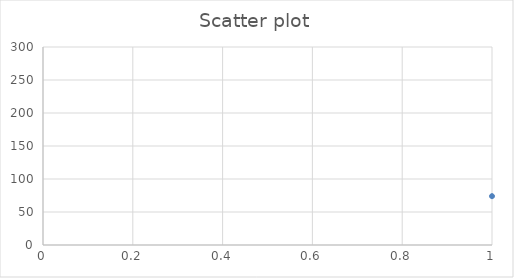
| Category | Series 0 |
|---|---|
| 0 | 74 |
| 1 | 87 |
| 2 | 99 |
| 3 | 61 |
| 4 | 76 |
| 5 | 87 |
| 6 | 92 |
| 7 | 89 |
| 8 | 124 |
| 9 | 77 |
| 10 | 51 |
| 11 | 77 |
| 12 | 71 |
| 13 | 78 |
| 14 | 66 |
| 15 | 78 |
| 16 | 102 |
| 17 | 67 |
| 18 | 42 |
| 19 | 77 |
| 20 | 157 |
| 21 | 115 |
| 22 | 76 |
| 23 | 83 |
| 24 | 78 |
| 25 | 83 |
| 26 | 52 |
| 27 | 57 |
| 28 | 63 |
| 29 | 79 |
| 30 | 101 |
| 31 | 79 |
| 32 | 67 |
| 33 | 72 |
| 34 | 60 |
| 35 | 130 |
| 36 | 46 |
| 37 | 84 |
| 38 | 147 |
| 39 | 102 |
| 40 | 95 |
| 41 | 96 |
| 42 | 64 |
| 43 | 40 |
| 44 | 173 |
| 45 | 88 |
| 46 | 80 |
| 47 | 124 |
| 48 | 89 |
| 49 | 66 |
| 50 | 71 |
| 51 | 81 |
| 52 | 84 |
| 53 | 100 |
| 54 | 140 |
| 55 | 67 |
| 56 | 126 |
| 57 | 70 |
| 58 | 55 |
| 59 | 99 |
| 60 | 76 |
| 61 | 91 |
| 62 | 164 |
| 63 | 152 |
| 64 | 128 |
| 65 | 131 |
| 66 | 122 |
| 67 | 191 |
| 68 | 87 |
| 69 | 83 |
| 70 | 85 |
| 71 | 63 |
| 72 | 93 |
| 73 | 76 |
| 74 | 107 |
| 75 | 64 |
| 76 | 78 |
| 77 | 140 |
| 78 | 66 |
| 79 | 51 |
| 80 | 112 |
| 81 | 52 |
| 82 | 73 |
| 83 | 81 |
| 84 | 109 |
| 85 | 68 |
| 86 | 57 |
| 87 | 78 |
| 88 | 67 |
| 89 | 120 |
| 90 | 87 |
| 91 | 69 |
| 92 | 71 |
| 93 | 108 |
| 94 | 76 |
| 95 | 83 |
| 96 | 113 |
| 97 | 72 |
| 98 | 116 |
| 99 | 89 |
| 100 | 100 |
| 101 | 110 |
| 102 | 76 |
| 103 | 84 |
| 104 | 123 |
| 105 | 77 |
| 106 | 83 |
| 107 | 71 |
| 108 | 82 |
| 109 | 87 |
| 110 | 66 |
| 111 | 61 |
| 112 | 114 |
| 113 | 76 |
| 114 | 72 |
| 115 | 100 |
| 116 | 46 |
| 117 | 53 |
| 118 | 136 |
| 119 | 105 |
| 120 | 65 |
| 121 | 106 |
| 122 | 108 |
| 123 | 61 |
| 124 | 93 |
| 125 | 67 |
| 126 | 110 |
| 127 | 158 |
| 128 | 79 |
| 129 | 75 |
| 130 | 92 |
| 131 | 136 |
| 132 | 74 |
| 133 | 117 |
| 134 | 114 |
| 135 | 102 |
| 136 | 86 |
| 137 | 105 |
| 138 | 91 |
| 139 | 64 |
| 140 | 58 |
| 141 | 104 |
| 142 | 138 |
| 143 | 109 |
| 144 | 71 |
| 145 | 98 |
| 146 | 54 |
| 147 | 78 |
| 148 | 48 |
| 149 | 147 |
| 150 | 160 |
| 151 | 80 |
| 152 | 73 |
| 153 | 72 |
| 154 | 117 |
| 155 | 125 |
| 156 | 107 |
| 157 | 95 |
| 158 | 76 |
| 159 | 38 |
| 160 | 65 |
| 161 | 97 |
| 162 | 74 |
| 163 | 103 |
| 164 | 118 |
| 165 | 106 |
| 166 | 79 |
| 167 | 54 |
| 168 | 75 |
| 169 | 74 |
| 170 | 96 |
| 171 | 86 |
| 172 | 84 |
| 173 | 79 |
| 174 | 98 |
| 175 | 88 |
| 176 | 74 |
| 177 | 139 |
| 178 | 79 |
| 179 | 72 |
| 180 | 97 |
| 181 | 80 |
| 182 | 89 |
| 183 | 145 |
| 184 | 81 |
| 185 | 73 |
| 186 | 100 |
| 187 | 102 |
| 188 | 145 |
| 189 | 92 |
| 190 | 83 |
| 191 | 108 |
| 192 | 101 |
| 193 | 97 |
| 194 | 106 |
| 195 | 171 |
| 196 | 102 |
| 197 | 102 |
| 198 | 140 |
| 199 | 125 |
| 200 | 74 |
| 201 | 75 |
| 202 | 122 |
| 203 | 87 |
| 204 | 61 |
| 205 | 80 |
| 206 | 60 |
| 207 | 202 |
| 208 | 75 |
| 209 | 70 |
| 210 | 107 |
| 211 | 63 |
| 212 | 92 |
| 213 | 87 |
| 214 | 83 |
| 215 | 77 |
| 216 | 73 |
| 217 | 91 |
| 218 | 76 |
| 219 | 74 |
| 220 | 92 |
| 221 | 113 |
| 222 | 83 |
| 223 | 139 |
| 224 | 66 |
| 225 | 49 |
| 226 | 65 |
| 227 | 72 |
| 228 | 88 |
| 229 | 74 |
| 230 | 81 |
| 231 | 87 |
| 232 | 79 |
| 233 | 92 |
| 234 | 84 |
| 235 | 130 |
| 236 | 77 |
| 237 | 66 |
| 238 | 62 |
| 239 | 75 |
| 240 | 95 |
| 241 | 49 |
| 242 | 69 |
| 243 | 122 |
| 244 | 83 |
| 245 | 137 |
| 246 | 83 |
| 247 | 52 |
| 248 | 95 |
| 249 | 64 |
| 250 | 87 |
| 251 | 76 |
| 252 | 65 |
| 253 | 78 |
| 254 | 48 |
| 255 | 88 |
| 256 | 114 |
| 257 | 78 |
| 258 | 85 |
| 259 | 90 |
| 260 | 79 |
| 261 | 110 |
| 262 | 57 |
| 263 | 66 |
| 264 | 75 |
| 265 | 98 |
| 266 | 136 |
| 267 | 83 |
| 268 | 67 |
| 269 | 75 |
| 270 | 124 |
| 271 | 43 |
| 272 | 85 |
| 273 | 97 |
| 274 | 91 |
| 275 | 67 |
| 276 | 114 |
| 277 | 75 |
| 278 | 90 |
| 279 | 91 |
| 280 | 78 |
| 281 | 46 |
| 282 | 77 |
| 283 | 80 |
| 284 | 121 |
| 285 | 119 |
| 286 | 67 |
| 287 | 91 |
| 288 | 133 |
| 289 | 123 |
| 290 | 111 |
| 291 | 79 |
| 292 | 101 |
| 293 | 62 |
| 294 | 109 |
| 295 | 85 |
| 296 | 69 |
| 297 | 127 |
| 298 | 118 |
| 299 | 112 |
| 300 | 106 |
| 301 | 84 |
| 302 | 94 |
| 303 | 79 |
| 304 | 101 |
| 305 | 80 |
| 306 | 89 |
| 307 | 70 |
| 308 | 73 |
| 309 | 88 |
| 310 | 100 |
| 311 | 106 |
| 312 | 83 |
| 313 | 89 |
| 314 | 78 |
| 315 | 92 |
| 316 | 81 |
| 317 | 90 |
| 318 | 76 |
| 319 | 75 |
| 320 | 80 |
| 321 | 82 |
| 322 | 69 |
| 323 | 104 |
| 324 | 69 |
| 325 | 72 |
| 326 | 74 |
| 327 | 49 |
| 328 | 79 |
| 329 | 85 |
| 330 | 112 |
| 331 | 88 |
| 332 | 43 |
| 333 | 120 |
| 334 | 137 |
| 335 | 45 |
| 336 | 123 |
| 337 | 62 |
| 338 | 60 |
| 339 | 97 |
| 340 | 136 |
| 341 | 69 |
| 342 | 91 |
| 343 | 60 |
| 344 | 76 |
| 345 | 141 |
| 346 | 64 |
| 347 | 82 |
| 348 | 126 |
| 349 | 85 |
| 350 | 60 |
| 351 | 67 |
| 352 | 88 |
| 353 | 94 |
| 354 | 160 |
| 355 | 160 |
| 356 | 84 |
| 357 | 86 |
| 358 | 77 |
| 359 | 68 |
| 360 | 74 |
| 361 | 77 |
| 362 | 67 |
| 363 | 98 |
| 364 | 53 |
| 365 | 87 |
| 366 | 61 |
| 367 | 115 |
| 368 | 92 |
| 369 | 70 |
| 370 | 44 |
| 371 | 125 |
| 372 | 78 |
| 373 | 90 |
| 374 | 100 |
| 375 | 128 |
| 376 | 51 |
| 377 | 125 |
| 378 | 48 |
| 379 | 96 |
| 380 | 81 |
| 381 | 78 |
| 382 | 116 |
| 383 | 110 |
| 384 | 84 |
| 385 | 66 |
| 386 | 136 |
| 387 | 90 |
| 388 | 81 |
| 389 | 70 |
| 390 | 74 |
| 391 | 112 |
| 392 | 97 |
| 393 | 46 |
| 394 | 34 |
| 395 | 71 |
| 396 | 106 |
| 397 | 67 |
| 398 | 78 |
| 399 | 78 |
| 400 | 62 |
| 401 | 76 |
| 402 | 71 |
| 403 | 86 |
| 404 | 99 |
| 405 | 99 |
| 406 | 75 |
| 407 | 100 |
| 408 | 116 |
| 409 | 60 |
| 410 | 80 |
| 411 | 201 |
| 412 | 85 |
| 413 | 63 |
| 414 | 109 |
| 415 | 86 |
| 416 | 100 |
| 417 | 80 |
| 418 | 73 |
| 419 | 72 |
| 420 | 82 |
| 421 | 67 |
| 422 | 102 |
| 423 | 104 |
| 424 | 73 |
| 425 | 85 |
| 426 | 114 |
| 427 | 61 |
| 428 | 76 |
| 429 | 101 |
| 430 | 86 |
| 431 | 68 |
| 432 | 88 |
| 433 | 126 |
| 434 | 96 |
| 435 | 119 |
| 436 | 109 |
| 437 | 85 |
| 438 | 57 |
| 439 | 45 |
| 440 | 113 |
| 441 | 36 |
| 442 | 106 |
| 443 | 70 |
| 444 | 57 |
| 445 | 63 |
| 446 | 83 |
| 447 | 61 |
| 448 | 65 |
| 449 | 45 |
| 450 | 57 |
| 451 | 100 |
| 452 | 75 |
| 453 | 87 |
| 454 | 45 |
| 455 | 116 |
| 456 | 63 |
| 457 | 70 |
| 458 | 84 |
| 459 | 79 |
| 460 | 82 |
| 461 | 62 |
| 462 | 82 |
| 463 | 123 |
| 464 | 84 |
| 465 | 149 |
| 466 | 81 |
| 467 | 109 |
| 468 | 80 |
| 469 | 118 |
| 470 | 97 |
| 471 | 91 |
| 472 | 116 |
| 473 | 84 |
| 474 | 58 |
| 475 | 71 |
| 476 | 88 |
| 477 | 104 |
| 478 | 131 |
| 479 | 77 |
| 480 | 96 |
| 481 | 62 |
| 482 | 57 |
| 483 | 61 |
| 484 | 131 |
| 485 | 71 |
| 486 | 83 |
| 487 | 69 |
| 488 | 70 |
| 489 | 88 |
| 490 | 81 |
| 491 | 77 |
| 492 | 97 |
| 493 | 91 |
| 494 | 112 |
| 495 | 71 |
| 496 | 99 |
| 497 | 74 |
| 498 | 85 |
| 499 | 165 |
| 500 | 96 |
| 501 | 104 |
| 502 | 138 |
| 503 | 87 |
| 504 | 115 |
| 505 | 79 |
| 506 | 66 |
| 507 | 56 |
| 508 | 66 |
| 509 | 98 |
| 510 | 81 |
| 511 | 88 |
| 512 | 136 |
| 513 | 141 |
| 514 | 86 |
| 515 | 65 |
| 516 | 124 |
| 517 | 73 |
| 518 | 69 |
| 519 | 77 |
| 520 | 80 |
| 521 | 113 |
| 522 | 117 |
| 523 | 96 |
| 524 | 59 |
| 525 | 83 |
| 526 | 98 |
| 527 | 156 |
| 528 | 52 |
| 529 | 59 |
| 530 | 73 |
| 531 | 72 |
| 532 | 52 |
| 533 | 84 |
| 534 | 82 |
| 535 | 97 |
| 536 | 92 |
| 537 | 94 |
| 538 | 162 |
| 539 | 74 |
| 540 | 78 |
| 541 | 75 |
| 542 | 106 |
| 543 | 77 |
| 544 | 99 |
| 545 | 106 |
| 546 | 43 |
| 547 | 121 |
| 548 | 124 |
| 549 | 107 |
| 550 | 36 |
| 551 | 62 |
| 552 | 50 |
| 553 | 122 |
| 554 | 144 |
| 555 | 78 |
| 556 | 133 |
| 557 | 144 |
| 558 | 56 |
| 559 | 69 |
| 560 | 148 |
| 561 | 205 |
| 562 | 77 |
| 563 | 88 |
| 564 | 66 |
| 565 | 50 |
| 566 | 130 |
| 567 | 63 |
| 568 | 79 |
| 569 | 93 |
| 570 | 167 |
| 571 | 85 |
| 572 | 55 |
| 573 | 96 |
| 574 | 98 |
| 575 | 69 |
| 576 | 97 |
| 577 | 81 |
| 578 | 91 |
| 579 | 147 |
| 580 | 77 |
| 581 | 33 |
| 582 | 68 |
| 583 | 54 |
| 584 | 71 |
| 585 | 69 |
| 586 | 118 |
| 587 | 89 |
| 588 | 75 |
| 589 | 112 |
| 590 | 98 |
| 591 | 59 |
| 592 | 89 |
| 593 | 94 |
| 594 | 84 |
| 595 | 64 |
| 596 | 44 |
| 597 | 89 |
| 598 | 119 |
| 599 | 80 |
| 600 | 72 |
| 601 | 103 |
| 602 | 73 |
| 603 | 83 |
| 604 | 70 |
| 605 | 73 |
| 606 | 87 |
| 607 | 159 |
| 608 | 77 |
| 609 | 93 |
| 610 | 69 |
| 611 | 57 |
| 612 | 136 |
| 613 | 99 |
| 614 | 76 |
| 615 | 104 |
| 616 | 73 |
| 617 | 77 |
| 618 | 151 |
| 619 | 91 |
| 620 | 65 |
| 621 | 84 |
| 622 | 99 |
| 623 | 120 |
| 624 | 72 |
| 625 | 116 |
| 626 | 106 |
| 627 | 55 |
| 628 | 106 |
| 629 | 63 |
| 630 | 103 |
| 631 | 105 |
| 632 | 104 |
| 633 | 101 |
| 634 | 66 |
| 635 | 114 |
| 636 | 69 |
| 637 | 86 |
| 638 | 70 |
| 639 | 67 |
| 640 | 56 |
| 641 | 87 |
| 642 | 95 |
| 643 | 77 |
| 644 | 71 |
| 645 | 76 |
| 646 | 67 |
| 647 | 105 |
| 648 | 90 |
| 649 | 73 |
| 650 | 64 |
| 651 | 124 |
| 652 | 36 |
| 653 | 96 |
| 654 | 77 |
| 655 | 84 |
| 656 | 54 |
| 657 | 127 |
| 658 | 66 |
| 659 | 74 |
| 660 | 89 |
| 661 | 109 |
| 662 | 81 |
| 663 | 85 |
| 664 | 64 |
| 665 | 81 |
| 666 | 72 |
| 667 | 92 |
| 668 | 90 |
| 669 | 87 |
| 670 | 112 |
| 671 | 80 |
| 672 | 103 |
| 673 | 105 |
| 674 | 87 |
| 675 | 80 |
| 676 | 73 |
| 677 | 166 |
| 678 | 47 |
| 679 | 92 |
| 680 | 154 |
| 681 | 120 |
| 682 | 83 |
| 683 | 60 |
| 684 | 53 |
| 685 | 92 |
| 686 | 112 |
| 687 | 126 |
| 688 | 95 |
| 689 | 104 |
| 690 | 117 |
| 691 | 120 |
| 692 | 52 |
| 693 | 152 |
| 694 | 102 |
| 695 | 65 |
| 696 | 78 |
| 697 | 73 |
| 698 | 59 |
| 699 | 99 |
| 700 | 209 |
| 701 | 79 |
| 702 | 137 |
| 703 | 114 |
| 704 | 95 |
| 705 | 58 |
| 706 | 61 |
| 707 | 61 |
| 708 | 87 |
| 709 | 60 |
| 710 | 36 |
| 711 | 97 |
| 712 | 75 |
| 713 | 163 |
| 714 | 70 |
| 715 | 84 |
| 716 | 89 |
| 717 | 99 |
| 718 | 31 |
| 719 | 75 |
| 720 | 68 |
| 721 | 60 |
| 722 | 68 |
| 723 | 52 |
| 724 | 48 |
| 725 | 82 |
| 726 | 71 |
| 727 | 108 |
| 728 | 85 |
| 729 | 79 |
| 730 | 76 |
| 731 | 112 |
| 732 | 80 |
| 733 | 98 |
| 734 | 41 |
| 735 | 75 |
| 736 | 76 |
| 737 | 162 |
| 738 | 148 |
| 739 | 104 |
| 740 | 63 |
| 741 | 103 |
| 742 | 78 |
| 743 | 78 |
| 744 | 85 |
| 745 | 50 |
| 746 | 101 |
| 747 | 86 |
| 748 | 71 |
| 749 | 53 |
| 750 | 105 |
| 751 | 76 |
| 752 | 48 |
| 753 | 67 |
| 754 | 125 |
| 755 | 50 |
| 756 | 74 |
| 757 | 35 |
| 758 | 69 |
| 759 | 154 |
| 760 | 101 |
| 761 | 64 |
| 762 | 102 |
| 763 | 88 |
| 764 | 65 |
| 765 | 98 |
| 766 | 85 |
| 767 | 80 |
| 768 | 92 |
| 769 | 64 |
| 770 | 71 |
| 771 | 66 |
| 772 | 69 |
| 773 | 198 |
| 774 | 64 |
| 775 | 55 |
| 776 | 73 |
| 777 | 117 |
| 778 | 78 |
| 779 | 60 |
| 780 | 71 |
| 781 | 76 |
| 782 | 50 |
| 783 | 93 |
| 784 | 57 |
| 785 | 111 |
| 786 | 88 |
| 787 | 110 |
| 788 | 82 |
| 789 | 101 |
| 790 | 87 |
| 791 | 114 |
| 792 | 65 |
| 793 | 97 |
| 794 | 157 |
| 795 | 100 |
| 796 | 115 |
| 797 | 81 |
| 798 | 112 |
| 799 | 73 |
| 800 | 88 |
| 801 | 82 |
| 802 | 69 |
| 803 | 46 |
| 804 | 125 |
| 805 | 98 |
| 806 | 119 |
| 807 | 105 |
| 808 | 77 |
| 809 | 70 |
| 810 | 93 |
| 811 | 85 |
| 812 | 83 |
| 813 | 50 |
| 814 | 96 |
| 815 | 112 |
| 816 | 79 |
| 817 | 55 |
| 818 | 76 |
| 819 | 107 |
| 820 | 79 |
| 821 | 99 |
| 822 | 97 |
| 823 | 76 |
| 824 | 150 |
| 825 | 132 |
| 826 | 107 |
| 827 | 86 |
| 828 | 75 |
| 829 | 72 |
| 830 | 44 |
| 831 | 76 |
| 832 | 88 |
| 833 | 121 |
| 834 | 88 |
| 835 | 91 |
| 836 | 125 |
| 837 | 128 |
| 838 | 68 |
| 839 | 90 |
| 840 | 97 |
| 841 | 100 |
| 842 | 100 |
| 843 | 89 |
| 844 | 82 |
| 845 | 54 |
| 846 | 58 |
| 847 | 93 |
| 848 | 76 |
| 849 | 97 |
| 850 | 87 |
| 851 | 52 |
| 852 | 74 |
| 853 | 51 |
| 854 | 83 |
| 855 | 98 |
| 856 | 113 |
| 857 | 60 |
| 858 | 70 |
| 859 | 92 |
| 860 | 89 |
| 861 | 107 |
| 862 | 80 |
| 863 | 78 |
| 864 | 69 |
| 865 | 64 |
| 866 | 93 |
| 867 | 101 |
| 868 | 90 |
| 869 | 97 |
| 870 | 86 |
| 871 | 63 |
| 872 | 82 |
| 873 | 101 |
| 874 | 71 |
| 875 | 44 |
| 876 | 85 |
| 877 | 71 |
| 878 | 76 |
| 879 | 90 |
| 880 | 81 |
| 881 | 100 |
| 882 | 87 |
| 883 | 79 |
| 884 | 85 |
| 885 | 74 |
| 886 | 82 |
| 887 | 90 |
| 888 | 77 |
| 889 | 103 |
| 890 | 66 |
| 891 | 98 |
| 892 | 125 |
| 893 | 56 |
| 894 | 115 |
| 895 | 78 |
| 896 | 103 |
| 897 | 75 |
| 898 | 94 |
| 899 | 70 |
| 900 | 94 |
| 901 | 123 |
| 902 | 77 |
| 903 | 147 |
| 904 | 143 |
| 905 | 102 |
| 906 | 58 |
| 907 | 66 |
| 908 | 125 |
| 909 | 111 |
| 910 | 78 |
| 911 | 138 |
| 912 | 82 |
| 913 | 94 |
| 914 | 91 |
| 915 | 96 |
| 916 | 52 |
| 917 | 71 |
| 918 | 40 |
| 919 | 105 |
| 920 | 82 |
| 921 | 87 |
| 922 | 118 |
| 923 | 90 |
| 924 | 49 |
| 925 | 63 |
| 926 | 80 |
| 927 | 94 |
| 928 | 75 |
| 929 | 94 |
| 930 | 70 |
| 931 | 80 |
| 932 | 89 |
| 933 | 76 |
| 934 | 106 |
| 935 | 73 |
| 936 | 120 |
| 937 | 74 |
| 938 | 159 |
| 939 | 52 |
| 940 | 92 |
| 941 | 121 |
| 942 | 78 |
| 943 | 82 |
| 944 | 83 |
| 945 | 80 |
| 946 | 68 |
| 947 | 69 |
| 948 | 86 |
| 949 | 58 |
| 950 | 68 |
| 951 | 86 |
| 952 | 66 |
| 953 | 56 |
| 954 | 88 |
| 955 | 84 |
| 956 | 72 |
| 957 | 82 |
| 958 | 83 |
| 959 | 41 |
| 960 | 84 |
| 961 | 145 |
| 962 | 96 |
| 963 | 63 |
| 964 | 77 |
| 965 | 42 |
| 966 | 71 |
| 967 | 77 |
| 968 | 73 |
| 969 | 40 |
| 970 | 66 |
| 971 | 81 |
| 972 | 65 |
| 973 | 115 |
| 974 | 111 |
| 975 | 84 |
| 976 | 76 |
| 977 | 121 |
| 978 | 75 |
| 979 | 68 |
| 980 | 81 |
| 981 | 74 |
| 982 | 72 |
| 983 | 37 |
| 984 | 101 |
| 985 | 108 |
| 986 | 59 |
| 987 | 89 |
| 988 | 80 |
| 989 | 79 |
| 990 | 97 |
| 991 | 81 |
| 992 | 113 |
| 993 | 78 |
| 994 | 47 |
| 995 | 71 |
| 996 | 83 |
| 997 | 64 |
| 998 | 84 |
| 999 | 89 |
| 1000 | 98 |
| 1001 | 108 |
| 1002 | 63 |
| 1003 | 107 |
| 1004 | 80 |
| 1005 | 96 |
| 1006 | 55 |
| 1007 | 84 |
| 1008 | 89 |
| 1009 | 78 |
| 1010 | 77 |
| 1011 | 104 |
| 1012 | 70 |
| 1013 | 92 |
| 1014 | 102 |
| 1015 | 84 |
| 1016 | 69 |
| 1017 | 103 |
| 1018 | 122 |
| 1019 | 83 |
| 1020 | 74 |
| 1021 | 54 |
| 1022 | 124 |
| 1023 | 86 |
| 1024 | 161 |
| 1025 | 57 |
| 1026 | 104 |
| 1027 | 66 |
| 1028 | 70 |
| 1029 | 86 |
| 1030 | 85 |
| 1031 | 69 |
| 1032 | 72 |
| 1033 | 78 |
| 1034 | 75 |
| 1035 | 106 |
| 1036 | 84 |
| 1037 | 79 |
| 1038 | 80 |
| 1039 | 96 |
| 1040 | 82 |
| 1041 | 109 |
| 1042 | 58 |
| 1043 | 81 |
| 1044 | 101 |
| 1045 | 119 |
| 1046 | 78 |
| 1047 | 128 |
| 1048 | 76 |
| 1049 | 85 |
| 1050 | 80 |
| 1051 | 93 |
| 1052 | 81 |
| 1053 | 110 |
| 1054 | 52 |
| 1055 | 67 |
| 1056 | 126 |
| 1057 | 120 |
| 1058 | 91 |
| 1059 | 81 |
| 1060 | 63 |
| 1061 | 94 |
| 1062 | 111 |
| 1063 | 66 |
| 1064 | 75 |
| 1065 | 55 |
| 1066 | 84 |
| 1067 | 64 |
| 1068 | 106 |
| 1069 | 98 |
| 1070 | 77 |
| 1071 | 116 |
| 1072 | 51 |
| 1073 | 98 |
| 1074 | 108 |
| 1075 | 56 |
| 1076 | 59 |
| 1077 | 85 |
| 1078 | 127 |
| 1079 | 64 |
| 1080 | 111 |
| 1081 | 86 |
| 1082 | 97 |
| 1083 | 158 |
| 1084 | 81 |
| 1085 | 87 |
| 1086 | 66 |
| 1087 | 70 |
| 1088 | 93 |
| 1089 | 77 |
| 1090 | 71 |
| 1091 | 78 |
| 1092 | 64 |
| 1093 | 67 |
| 1094 | 75 |
| 1095 | 77 |
| 1096 | 130 |
| 1097 | 73 |
| 1098 | 75 |
| 1099 | 100 |
| 1100 | 58 |
| 1101 | 119 |
| 1102 | 73 |
| 1103 | 103 |
| 1104 | 74 |
| 1105 | 75 |
| 1106 | 67 |
| 1107 | 77 |
| 1108 | 61 |
| 1109 | 66 |
| 1110 | 67 |
| 1111 | 52 |
| 1112 | 43 |
| 1113 | 92 |
| 1114 | 79 |
| 1115 | 103 |
| 1116 | 82 |
| 1117 | 107 |
| 1118 | 75 |
| 1119 | 80 |
| 1120 | 138 |
| 1121 | 82 |
| 1122 | 64 |
| 1123 | 80 |
| 1124 | 81 |
| 1125 | 78 |
| 1126 | 79 |
| 1127 | 73 |
| 1128 | 54 |
| 1129 | 102 |
| 1130 | 68 |
| 1131 | 113 |
| 1132 | 72 |
| 1133 | 94 |
| 1134 | 85 |
| 1135 | 82 |
| 1136 | 107 |
| 1137 | 120 |
| 1138 | 92 |
| 1139 | 76 |
| 1140 | 94 |
| 1141 | 105 |
| 1142 | 101 |
| 1143 | 47 |
| 1144 | 116 |
| 1145 | 71 |
| 1146 | 95 |
| 1147 | 75 |
| 1148 | 58 |
| 1149 | 176 |
| 1150 | 112 |
| 1151 | 79 |
| 1152 | 85 |
| 1153 | 80 |
| 1154 | 83 |
| 1155 | 106 |
| 1156 | 64 |
| 1157 | 77 |
| 1158 | 45 |
| 1159 | 80 |
| 1160 | 72 |
| 1161 | 85 |
| 1162 | 72 |
| 1163 | 59 |
| 1164 | 74 |
| 1165 | 95 |
| 1166 | 98 |
| 1167 | 83 |
| 1168 | 80 |
| 1169 | 74 |
| 1170 | 75 |
| 1171 | 85 |
| 1172 | 133 |
| 1173 | 94 |
| 1174 | 110 |
| 1175 | 118 |
| 1176 | 128 |
| 1177 | 79 |
| 1178 | 89 |
| 1179 | 134 |
| 1180 | 88 |
| 1181 | 88 |
| 1182 | 97 |
| 1183 | 76 |
| 1184 | 82 |
| 1185 | 74 |
| 1186 | 83 |
| 1187 | 55 |
| 1188 | 80 |
| 1189 | 43 |
| 1190 | 134 |
| 1191 | 151 |
| 1192 | 84 |
| 1193 | 138 |
| 1194 | 86 |
| 1195 | 63 |
| 1196 | 71 |
| 1197 | 84 |
| 1198 | 83 |
| 1199 | 113 |
| 1200 | 97 |
| 1201 | 116 |
| 1202 | 118 |
| 1203 | 84 |
| 1204 | 71 |
| 1205 | 88 |
| 1206 | 94 |
| 1207 | 92 |
| 1208 | 142 |
| 1209 | 109 |
| 1210 | 75 |
| 1211 | 103 |
| 1212 | 78 |
| 1213 | 98 |
| 1214 | 118 |
| 1215 | 125 |
| 1216 | 64 |
| 1217 | 110 |
| 1218 | 66 |
| 1219 | 118 |
| 1220 | 53 |
| 1221 | 111 |
| 1222 | 109 |
| 1223 | 68 |
| 1224 | 103 |
| 1225 | 89 |
| 1226 | 108 |
| 1227 | 108 |
| 1228 | 64 |
| 1229 | 79 |
| 1230 | 108 |
| 1231 | 72 |
| 1232 | 121 |
| 1233 | 74 |
| 1234 | 87 |
| 1235 | 62 |
| 1236 | 82 |
| 1237 | 71 |
| 1238 | 83 |
| 1239 | 84 |
| 1240 | 122 |
| 1241 | 68 |
| 1242 | 48 |
| 1243 | 103 |
| 1244 | 72 |
| 1245 | 131 |
| 1246 | 79 |
| 1247 | 142 |
| 1248 | 89 |
| 1249 | 131 |
| 1250 | 83 |
| 1251 | 95 |
| 1252 | 75 |
| 1253 | 90 |
| 1254 | 93 |
| 1255 | 69 |
| 1256 | 89 |
| 1257 | 112 |
| 1258 | 95 |
| 1259 | 77 |
| 1260 | 98 |
| 1261 | 78 |
| 1262 | 87 |
| 1263 | 59 |
| 1264 | 96 |
| 1265 | 103 |
| 1266 | 77 |
| 1267 | 122 |
| 1268 | 108 |
| 1269 | 85 |
| 1270 | 87 |
| 1271 | 49 |
| 1272 | 51 |
| 1273 | 97 |
| 1274 | 46 |
| 1275 | 94 |
| 1276 | 65 |
| 1277 | 123 |
| 1278 | 72 |
| 1279 | 72 |
| 1280 | 99 |
| 1281 | 45 |
| 1282 | 76 |
| 1283 | 78 |
| 1284 | 63 |
| 1285 | 114 |
| 1286 | 76 |
| 1287 | 60 |
| 1288 | 73 |
| 1289 | 177 |
| 1290 | 54 |
| 1291 | 81 |
| 1292 | 62 |
| 1293 | 85 |
| 1294 | 131 |
| 1295 | 75 |
| 1296 | 76 |
| 1297 | 97 |
| 1298 | 61 |
| 1299 | 115 |
| 1300 | 93 |
| 1301 | 105 |
| 1302 | 140 |
| 1303 | 99 |
| 1304 | 76 |
| 1305 | 35 |
| 1306 | 70 |
| 1307 | 86 |
| 1308 | 60 |
| 1309 | 73 |
| 1310 | 90 |
| 1311 | 84 |
| 1312 | 69 |
| 1313 | 80 |
| 1314 | 109 |
| 1315 | 54 |
| 1316 | 73 |
| 1317 | 72 |
| 1318 | 58 |
| 1319 | 55 |
| 1320 | 63 |
| 1321 | 105 |
| 1322 | 88 |
| 1323 | 76 |
| 1324 | 164 |
| 1325 | 52 |
| 1326 | 94 |
| 1327 | 121 |
| 1328 | 89 |
| 1329 | 101 |
| 1330 | 109 |
| 1331 | 68 |
| 1332 | 75 |
| 1333 | 115 |
| 1334 | 101 |
| 1335 | 105 |
| 1336 | 40 |
| 1337 | 78 |
| 1338 | 92 |
| 1339 | 86 |
| 1340 | 80 |
| 1341 | 100 |
| 1342 | 120 |
| 1343 | 80 |
| 1344 | 78 |
| 1345 | 85 |
| 1346 | 54 |
| 1347 | 82 |
| 1348 | 109 |
| 1349 | 140 |
| 1350 | 63 |
| 1351 | 55 |
| 1352 | 112 |
| 1353 | 102 |
| 1354 | 62 |
| 1355 | 49 |
| 1356 | 81 |
| 1357 | 90 |
| 1358 | 105 |
| 1359 | 74 |
| 1360 | 93 |
| 1361 | 82 |
| 1362 | 156 |
| 1363 | 87 |
| 1364 | 92 |
| 1365 | 69 |
| 1366 | 78 |
| 1367 | 153 |
| 1368 | 107 |
| 1369 | 74 |
| 1370 | 85 |
| 1371 | 60 |
| 1372 | 78 |
| 1373 | 111 |
| 1374 | 77 |
| 1375 | 76 |
| 1376 | 49 |
| 1377 | 46 |
| 1378 | 56 |
| 1379 | 64 |
| 1380 | 81 |
| 1381 | 72 |
| 1382 | 56 |
| 1383 | 97 |
| 1384 | 82 |
| 1385 | 139 |
| 1386 | 82 |
| 1387 | 78 |
| 1388 | 78 |
| 1389 | 72 |
| 1390 | 52 |
| 1391 | 125 |
| 1392 | 58 |
| 1393 | 89 |
| 1394 | 45 |
| 1395 | 97 |
| 1396 | 85 |
| 1397 | 96 |
| 1398 | 107 |
| 1399 | 45 |
| 1400 | 84 |
| 1401 | 66 |
| 1402 | 72 |
| 1403 | 62 |
| 1404 | 66 |
| 1405 | 93 |
| 1406 | 110 |
| 1407 | 97 |
| 1408 | 72 |
| 1409 | 95 |
| 1410 | 136 |
| 1411 | 103 |
| 1412 | 67 |
| 1413 | 68 |
| 1414 | 102 |
| 1415 | 89 |
| 1416 | 64 |
| 1417 | 100 |
| 1418 | 145 |
| 1419 | 33 |
| 1420 | 78 |
| 1421 | 95 |
| 1422 | 130 |
| 1423 | 93 |
| 1424 | 58 |
| 1425 | 162 |
| 1426 | 111 |
| 1427 | 54 |
| 1428 | 74 |
| 1429 | 94 |
| 1430 | 51 |
| 1431 | 100 |
| 1432 | 109 |
| 1433 | 83 |
| 1434 | 76 |
| 1435 | 66 |
| 1436 | 77 |
| 1437 | 138 |
| 1438 | 73 |
| 1439 | 46 |
| 1440 | 72 |
| 1441 | 75 |
| 1442 | 90 |
| 1443 | 77 |
| 1444 | 69 |
| 1445 | 41 |
| 1446 | 100 |
| 1447 | 87 |
| 1448 | 74 |
| 1449 | 55 |
| 1450 | 77 |
| 1451 | 115 |
| 1452 | 96 |
| 1453 | 77 |
| 1454 | 76 |
| 1455 | 69 |
| 1456 | 115 |
| 1457 | 60 |
| 1458 | 89 |
| 1459 | 80 |
| 1460 | 90 |
| 1461 | 79 |
| 1462 | 83 |
| 1463 | 49 |
| 1464 | 84 |
| 1465 | 103 |
| 1466 | 47 |
| 1467 | 64 |
| 1468 | 54 |
| 1469 | 56 |
| 1470 | 77 |
| 1471 | 64 |
| 1472 | 106 |
| 1473 | 75 |
| 1474 | 80 |
| 1475 | 85 |
| 1476 | 100 |
| 1477 | 62 |
| 1478 | 103 |
| 1479 | 72 |
| 1480 | 61 |
| 1481 | 81 |
| 1482 | 92 |
| 1483 | 106 |
| 1484 | 112 |
| 1485 | 111 |
| 1486 | 97 |
| 1487 | 101 |
| 1488 | 89 |
| 1489 | 102 |
| 1490 | 103 |
| 1491 | 65 |
| 1492 | 64 |
| 1493 | 62 |
| 1494 | 80 |
| 1495 | 109 |
| 1496 | 115 |
| 1497 | 98 |
| 1498 | 65 |
| 1499 | 80 |
| 1500 | 104 |
| 1501 | 63 |
| 1502 | 88 |
| 1503 | 125 |
| 1504 | 112 |
| 1505 | 49 |
| 1506 | 85 |
| 1507 | 110 |
| 1508 | 76 |
| 1509 | 76 |
| 1510 | 81 |
| 1511 | 168 |
| 1512 | 76 |
| 1513 | 71 |
| 1514 | 59 |
| 1515 | 95 |
| 1516 | 82 |
| 1517 | 74 |
| 1518 | 73 |
| 1519 | 129 |
| 1520 | 73 |
| 1521 | 62 |
| 1522 | 92 |
| 1523 | 77 |
| 1524 | 45 |
| 1525 | 53 |
| 1526 | 51 |
| 1527 | 65 |
| 1528 | 98 |
| 1529 | 98 |
| 1530 | 77 |
| 1531 | 109 |
| 1532 | 135 |
| 1533 | 42 |
| 1534 | 39 |
| 1535 | 79 |
| 1536 | 75 |
| 1537 | 93 |
| 1538 | 84 |
| 1539 | 74 |
| 1540 | 146 |
| 1541 | 103 |
| 1542 | 53 |
| 1543 | 117 |
| 1544 | 55 |
| 1545 | 101 |
| 1546 | 78 |
| 1547 | 61 |
| 1548 | 70 |
| 1549 | 62 |
| 1550 | 55 |
| 1551 | 120 |
| 1552 | 63 |
| 1553 | 112 |
| 1554 | 82 |
| 1555 | 93 |
| 1556 | 149 |
| 1557 | 69 |
| 1558 | 84 |
| 1559 | 59 |
| 1560 | 76 |
| 1561 | 58 |
| 1562 | 74 |
| 1563 | 110 |
| 1564 | 76 |
| 1565 | 116 |
| 1566 | 111 |
| 1567 | 74 |
| 1568 | 122 |
| 1569 | 112 |
| 1570 | 123 |
| 1571 | 87 |
| 1572 | 75 |
| 1573 | 88 |
| 1574 | 85 |
| 1575 | 94 |
| 1576 | 88 |
| 1577 | 78 |
| 1578 | 69 |
| 1579 | 96 |
| 1580 | 192 |
| 1581 | 81 |
| 1582 | 99 |
| 1583 | 113 |
| 1584 | 94 |
| 1585 | 85 |
| 1586 | 57 |
| 1587 | 62 |
| 1588 | 101 |
| 1589 | 84 |
| 1590 | 82 |
| 1591 | 45 |
| 1592 | 81 |
| 1593 | 173 |
| 1594 | 91 |
| 1595 | 110 |
| 1596 | 37 |
| 1597 | 55 |
| 1598 | 114 |
| 1599 | 75 |
| 1600 | 28 |
| 1601 | 43 |
| 1602 | 78 |
| 1603 | 100 |
| 1604 | 118 |
| 1605 | 86 |
| 1606 | 81 |
| 1607 | 84 |
| 1608 | 82 |
| 1609 | 40 |
| 1610 | 62 |
| 1611 | 90 |
| 1612 | 49 |
| 1613 | 67 |
| 1614 | 77 |
| 1615 | 79 |
| 1616 | 78 |
| 1617 | 100 |
| 1618 | 52 |
| 1619 | 97 |
| 1620 | 69 |
| 1621 | 68 |
| 1622 | 75 |
| 1623 | 78 |
| 1624 | 86 |
| 1625 | 78 |
| 1626 | 73 |
| 1627 | 87 |
| 1628 | 91 |
| 1629 | 75 |
| 1630 | 142 |
| 1631 | 135 |
| 1632 | 118 |
| 1633 | 82 |
| 1634 | 69 |
| 1635 | 109 |
| 1636 | 88 |
| 1637 | 95 |
| 1638 | 111 |
| 1639 | 55 |
| 1640 | 54 |
| 1641 | 119 |
| 1642 | 51 |
| 1643 | 80 |
| 1644 | 89 |
| 1645 | 69 |
| 1646 | 112 |
| 1647 | 78 |
| 1648 | 171 |
| 1649 | 72 |
| 1650 | 86 |
| 1651 | 77 |
| 1652 | 137 |
| 1653 | 74 |
| 1654 | 119 |
| 1655 | 80 |
| 1656 | 33 |
| 1657 | 126 |
| 1658 | 67 |
| 1659 | 100 |
| 1660 | 38 |
| 1661 | 114 |
| 1662 | 115 |
| 1663 | 86 |
| 1664 | 100 |
| 1665 | 93 |
| 1666 | 80 |
| 1667 | 77 |
| 1668 | 81 |
| 1669 | 88 |
| 1670 | 96 |
| 1671 | 68 |
| 1672 | 109 |
| 1673 | 107 |
| 1674 | 76 |
| 1675 | 105 |
| 1676 | 97 |
| 1677 | 104 |
| 1678 | 149 |
| 1679 | 54 |
| 1680 | 103 |
| 1681 | 76 |
| 1682 | 85 |
| 1683 | 111 |
| 1684 | 60 |
| 1685 | 101 |
| 1686 | 64 |
| 1687 | 41 |
| 1688 | 72 |
| 1689 | 79 |
| 1690 | 71 |
| 1691 | 78 |
| 1692 | 85 |
| 1693 | 92 |
| 1694 | 77 |
| 1695 | 84 |
| 1696 | 159 |
| 1697 | 57 |
| 1698 | 70 |
| 1699 | 77 |
| 1700 | 92 |
| 1701 | 117 |
| 1702 | 91 |
| 1703 | 62 |
| 1704 | 70 |
| 1705 | 50 |
| 1706 | 86 |
| 1707 | 97 |
| 1708 | 72 |
| 1709 | 52 |
| 1710 | 74 |
| 1711 | 191 |
| 1712 | 77 |
| 1713 | 140 |
| 1714 | 92 |
| 1715 | 68 |
| 1716 | 68 |
| 1717 | 88 |
| 1718 | 83 |
| 1719 | 70 |
| 1720 | 59 |
| 1721 | 55 |
| 1722 | 111 |
| 1723 | 97 |
| 1724 | 33 |
| 1725 | 91 |
| 1726 | 68 |
| 1727 | 80 |
| 1728 | 54 |
| 1729 | 108 |
| 1730 | 76 |
| 1731 | 91 |
| 1732 | 138 |
| 1733 | 131 |
| 1734 | 78 |
| 1735 | 163 |
| 1736 | 93 |
| 1737 | 93 |
| 1738 | 49 |
| 1739 | 150 |
| 1740 | 98 |
| 1741 | 90 |
| 1742 | 70 |
| 1743 | 76 |
| 1744 | 162 |
| 1745 | 79 |
| 1746 | 103 |
| 1747 | 67 |
| 1748 | 122 |
| 1749 | 81 |
| 1750 | 78 |
| 1751 | 76 |
| 1752 | 44 |
| 1753 | 81 |
| 1754 | 47 |
| 1755 | 74 |
| 1756 | 64 |
| 1757 | 129 |
| 1758 | 81 |
| 1759 | 76 |
| 1760 | 113 |
| 1761 | 93 |
| 1762 | 77 |
| 1763 | 74 |
| 1764 | 79 |
| 1765 | 86 |
| 1766 | 84 |
| 1767 | 80 |
| 1768 | 85 |
| 1769 | 77 |
| 1770 | 60 |
| 1771 | 68 |
| 1772 | 99 |
| 1773 | 102 |
| 1774 | 74 |
| 1775 | 55 |
| 1776 | 79 |
| 1777 | 55 |
| 1778 | 135 |
| 1779 | 130 |
| 1780 | 75 |
| 1781 | 72 |
| 1782 | 86 |
| 1783 | 84 |
| 1784 | 133 |
| 1785 | 69 |
| 1786 | 103 |
| 1787 | 76 |
| 1788 | 115 |
| 1789 | 49 |
| 1790 | 79 |
| 1791 | 76 |
| 1792 | 106 |
| 1793 | 104 |
| 1794 | 112 |
| 1795 | 37 |
| 1796 | 70 |
| 1797 | 67 |
| 1798 | 76 |
| 1799 | 69 |
| 1800 | 86 |
| 1801 | 83 |
| 1802 | 86 |
| 1803 | 113 |
| 1804 | 107 |
| 1805 | 141 |
| 1806 | 124 |
| 1807 | 106 |
| 1808 | 156 |
| 1809 | 75 |
| 1810 | 97 |
| 1811 | 75 |
| 1812 | 187 |
| 1813 | 78 |
| 1814 | 63 |
| 1815 | 67 |
| 1816 | 113 |
| 1817 | 115 |
| 1818 | 140 |
| 1819 | 83 |
| 1820 | 101 |
| 1821 | 75 |
| 1822 | 78 |
| 1823 | 81 |
| 1824 | 80 |
| 1825 | 72 |
| 1826 | 102 |
| 1827 | 68 |
| 1828 | 59 |
| 1829 | 63 |
| 1830 | 101 |
| 1831 | 78 |
| 1832 | 82 |
| 1833 | 90 |
| 1834 | 72 |
| 1835 | 61 |
| 1836 | 101 |
| 1837 | 76 |
| 1838 | 106 |
| 1839 | 131 |
| 1840 | 185 |
| 1841 | 57 |
| 1842 | 74 |
| 1843 | 77 |
| 1844 | 118 |
| 1845 | 122 |
| 1846 | 79 |
| 1847 | 124 |
| 1848 | 81 |
| 1849 | 76 |
| 1850 | 94 |
| 1851 | 84 |
| 1852 | 80 |
| 1853 | 75 |
| 1854 | 76 |
| 1855 | 71 |
| 1856 | 76 |
| 1857 | 88 |
| 1858 | 89 |
| 1859 | 117 |
| 1860 | 65 |
| 1861 | 115 |
| 1862 | 88 |
| 1863 | 65 |
| 1864 | 123 |
| 1865 | 75 |
| 1866 | 77 |
| 1867 | 84 |
| 1868 | 82 |
| 1869 | 44 |
| 1870 | 46 |
| 1871 | 134 |
| 1872 | 85 |
| 1873 | 141 |
| 1874 | 78 |
| 1875 | 88 |
| 1876 | 69 |
| 1877 | 79 |
| 1878 | 60 |
| 1879 | 67 |
| 1880 | 91 |
| 1881 | 76 |
| 1882 | 74 |
| 1883 | 64 |
| 1884 | 76 |
| 1885 | 69 |
| 1886 | 125 |
| 1887 | 97 |
| 1888 | 81 |
| 1889 | 99 |
| 1890 | 71 |
| 1891 | 116 |
| 1892 | 89 |
| 1893 | 68 |
| 1894 | 115 |
| 1895 | 76 |
| 1896 | 140 |
| 1897 | 103 |
| 1898 | 79 |
| 1899 | 80 |
| 1900 | 65 |
| 1901 | 79 |
| 1902 | 102 |
| 1903 | 92 |
| 1904 | 88 |
| 1905 | 66 |
| 1906 | 87 |
| 1907 | 70 |
| 1908 | 66 |
| 1909 | 84 |
| 1910 | 144 |
| 1911 | 74 |
| 1912 | 136 |
| 1913 | 72 |
| 1914 | 90 |
| 1915 | 88 |
| 1916 | 53 |
| 1917 | 48 |
| 1918 | 117 |
| 1919 | 167 |
| 1920 | 52 |
| 1921 | 55 |
| 1922 | 147 |
| 1923 | 153 |
| 1924 | 88 |
| 1925 | 50 |
| 1926 | 75 |
| 1927 | 114 |
| 1928 | 74 |
| 1929 | 78 |
| 1930 | 79 |
| 1931 | 101 |
| 1932 | 107 |
| 1933 | 78 |
| 1934 | 48 |
| 1935 | 81 |
| 1936 | 89 |
| 1937 | 171 |
| 1938 | 47 |
| 1939 | 82 |
| 1940 | 94 |
| 1941 | 111 |
| 1942 | 62 |
| 1943 | 179 |
| 1944 | 123 |
| 1945 | 80 |
| 1946 | 73 |
| 1947 | 104 |
| 1948 | 65 |
| 1949 | 97 |
| 1950 | 75 |
| 1951 | 101 |
| 1952 | 65 |
| 1953 | 51 |
| 1954 | 190 |
| 1955 | 99 |
| 1956 | 131 |
| 1957 | 143 |
| 1958 | 74 |
| 1959 | 47 |
| 1960 | 80 |
| 1961 | 95 |
| 1962 | 75 |
| 1963 | 52 |
| 1964 | 82 |
| 1965 | 95 |
| 1966 | 92 |
| 1967 | 93 |
| 1968 | 75 |
| 1969 | 106 |
| 1970 | 68 |
| 1971 | 68 |
| 1972 | 95 |
| 1973 | 68 |
| 1974 | 67 |
| 1975 | 77 |
| 1976 | 79 |
| 1977 | 107 |
| 1978 | 53 |
| 1979 | 64 |
| 1980 | 59 |
| 1981 | 87 |
| 1982 | 83 |
| 1983 | 66 |
| 1984 | 76 |
| 1985 | 76 |
| 1986 | 61 |
| 1987 | 122 |
| 1988 | 107 |
| 1989 | 92 |
| 1990 | 94 |
| 1991 | 72 |
| 1992 | 96 |
| 1993 | 79 |
| 1994 | 75 |
| 1995 | 76 |
| 1996 | 53 |
| 1997 | 108 |
| 1998 | 117 |
| 1999 | 112 |
| 2000 | 107 |
| 2001 | 84 |
| 2002 | 30 |
| 2003 | 79 |
| 2004 | 119 |
| 2005 | 75 |
| 2006 | 77 |
| 2007 | 103 |
| 2008 | 88 |
| 2009 | 71 |
| 2010 | 149 |
| 2011 | 82 |
| 2012 | 102 |
| 2013 | 73 |
| 2014 | 73 |
| 2015 | 75 |
| 2016 | 263 |
| 2017 | 78 |
| 2018 | 79 |
| 2019 | 120 |
| 2020 | 69 |
| 2021 | 73 |
| 2022 | 120 |
| 2023 | 79 |
| 2024 | 69 |
| 2025 | 64 |
| 2026 | 113 |
| 2027 | 83 |
| 2028 | 79 |
| 2029 | 120 |
| 2030 | 85 |
| 2031 | 57 |
| 2032 | 71 |
| 2033 | 81 |
| 2034 | 76 |
| 2035 | 153 |
| 2036 | 139 |
| 2037 | 84 |
| 2038 | 95 |
| 2039 | 66 |
| 2040 | 91 |
| 2041 | 90 |
| 2042 | 135 |
| 2043 | 80 |
| 2044 | 47 |
| 2045 | 63 |
| 2046 | 73 |
| 2047 | 132 |
| 2048 | 151 |
| 2049 | 71 |
| 2050 | 80 |
| 2051 | 122 |
| 2052 | 50 |
| 2053 | 96 |
| 2054 | 92 |
| 2055 | 139 |
| 2056 | 69 |
| 2057 | 52 |
| 2058 | 96 |
| 2059 | 77 |
| 2060 | 73 |
| 2061 | 91 |
| 2062 | 92 |
| 2063 | 59 |
| 2064 | 64 |
| 2065 | 54 |
| 2066 | 79 |
| 2067 | 70 |
| 2068 | 86 |
| 2069 | 125 |
| 2070 | 61 |
| 2071 | 136 |
| 2072 | 81 |
| 2073 | 72 |
| 2074 | 107 |
| 2075 | 78 |
| 2076 | 107 |
| 2077 | 70 |
| 2078 | 160 |
| 2079 | 94 |
| 2080 | 47 |
| 2081 | 139 |
| 2082 | 60 |
| 2083 | 66 |
| 2084 | 75 |
| 2085 | 74 |
| 2086 | 74 |
| 2087 | 94 |
| 2088 | 102 |
| 2089 | 117 |
| 2090 | 144 |
| 2091 | 117 |
| 2092 | 121 |
| 2093 | 72 |
| 2094 | 145 |
| 2095 | 39 |
| 2096 | 72 |
| 2097 | 77 |
| 2098 | 141 |
| 2099 | 39 |
| 2100 | 85 |
| 2101 | 87 |
| 2102 | 79 |
| 2103 | 54 |
| 2104 | 68 |
| 2105 | 104 |
| 2106 | 115 |
| 2107 | 44 |
| 2108 | 130 |
| 2109 | 105 |
| 2110 | 94 |
| 2111 | 87 |
| 2112 | 65 |
| 2113 | 81 |
| 2114 | 60 |
| 2115 | 64 |
| 2116 | 97 |
| 2117 | 58 |
| 2118 | 100 |
| 2119 | 50 |
| 2120 | 97 |
| 2121 | 114 |
| 2122 | 35 |
| 2123 | 77 |
| 2124 | 113 |
| 2125 | 81 |
| 2126 | 133 |
| 2127 | 69 |
| 2128 | 92 |
| 2129 | 94 |
| 2130 | 94 |
| 2131 | 114 |
| 2132 | 72 |
| 2133 | 104 |
| 2134 | 66 |
| 2135 | 90 |
| 2136 | 104 |
| 2137 | 65 |
| 2138 | 78 |
| 2139 | 90 |
| 2140 | 77 |
| 2141 | 75 |
| 2142 | 77 |
| 2143 | 78 |
| 2144 | 78 |
| 2145 | 79 |
| 2146 | 71 |
| 2147 | 88 |
| 2148 | 74 |
| 2149 | 84 |
| 2150 | 58 |
| 2151 | 69 |
| 2152 | 126 |
| 2153 | 79 |
| 2154 | 143 |
| 2155 | 102 |
| 2156 | 88 |
| 2157 | 70 |
| 2158 | 127 |
| 2159 | 105 |
| 2160 | 95 |
| 2161 | 60 |
| 2162 | 61 |
| 2163 | 86 |
| 2164 | 63 |
| 2165 | 77 |
| 2166 | 123 |
| 2167 | 93 |
| 2168 | 71 |
| 2169 | 78 |
| 2170 | 105 |
| 2171 | 71 |
| 2172 | 92 |
| 2173 | 94 |
| 2174 | 109 |
| 2175 | 95 |
| 2176 | 104 |
| 2177 | 106 |
| 2178 | 74 |
| 2179 | 60 |
| 2180 | 91 |
| 2181 | 88 |
| 2182 | 149 |
| 2183 | 60 |
| 2184 | 73 |
| 2185 | 84 |
| 2186 | 69 |
| 2187 | 52 |
| 2188 | 73 |
| 2189 | 79 |
| 2190 | 132 |
| 2191 | 71 |
| 2192 | 73 |
| 2193 | 50 |
| 2194 | 74 |
| 2195 | 76 |
| 2196 | 112 |
| 2197 | 86 |
| 2198 | 68 |
| 2199 | 54 |
| 2200 | 81 |
| 2201 | 83 |
| 2202 | 56 |
| 2203 | 87 |
| 2204 | 100 |
| 2205 | 90 |
| 2206 | 79 |
| 2207 | 138 |
| 2208 | 117 |
| 2209 | 91 |
| 2210 | 79 |
| 2211 | 94 |
| 2212 | 94 |
| 2213 | 88 |
| 2214 | 77 |
| 2215 | 64 |
| 2216 | 88 |
| 2217 | 77 |
| 2218 | 74 |
| 2219 | 81 |
| 2220 | 77 |
| 2221 | 78 |
| 2222 | 147 |
| 2223 | 92 |
| 2224 | 96 |
| 2225 | 93 |
| 2226 | 79 |
| 2227 | 63 |
| 2228 | 132 |
| 2229 | 93 |
| 2230 | 95 |
| 2231 | 99 |
| 2232 | 72 |
| 2233 | 75 |
| 2234 | 120 |
| 2235 | 119 |
| 2236 | 78 |
| 2237 | 42 |
| 2238 | 128 |
| 2239 | 62 |
| 2240 | 65 |
| 2241 | 70 |
| 2242 | 86 |
| 2243 | 115 |
| 2244 | 108 |
| 2245 | 87 |
| 2246 | 70 |
| 2247 | 119 |
| 2248 | 74 |
| 2249 | 125 |
| 2250 | 55 |
| 2251 | 65 |
| 2252 | 83 |
| 2253 | 78 |
| 2254 | 102 |
| 2255 | 52 |
| 2256 | 112 |
| 2257 | 79 |
| 2258 | 91 |
| 2259 | 75 |
| 2260 | 132 |
| 2261 | 70 |
| 2262 | 68 |
| 2263 | 69 |
| 2264 | 81 |
| 2265 | 66 |
| 2266 | 78 |
| 2267 | 77 |
| 2268 | 81 |
| 2269 | 55 |
| 2270 | 66 |
| 2271 | 83 |
| 2272 | 132 |
| 2273 | 68 |
| 2274 | 87 |
| 2275 | 63 |
| 2276 | 80 |
| 2277 | 77 |
| 2278 | 112 |
| 2279 | 81 |
| 2280 | 48 |
| 2281 | 88 |
| 2282 | 103 |
| 2283 | 94 |
| 2284 | 48 |
| 2285 | 84 |
| 2286 | 78 |
| 2287 | 79 |
| 2288 | 74 |
| 2289 | 107 |
| 2290 | 83 |
| 2291 | 68 |
| 2292 | 78 |
| 2293 | 167 |
| 2294 | 83 |
| 2295 | 46 |
| 2296 | 82 |
| 2297 | 69 |
| 2298 | 84 |
| 2299 | 84 |
| 2300 | 78 |
| 2301 | 102 |
| 2302 | 67 |
| 2303 | 78 |
| 2304 | 84 |
| 2305 | 75 |
| 2306 | 97 |
| 2307 | 87 |
| 2308 | 82 |
| 2309 | 64 |
| 2310 | 94 |
| 2311 | 91 |
| 2312 | 73 |
| 2313 | 48 |
| 2314 | 100 |
| 2315 | 68 |
| 2316 | 160 |
| 2317 | 60 |
| 2318 | 69 |
| 2319 | 78 |
| 2320 | 77 |
| 2321 | 57 |
| 2322 | 89 |
| 2323 | 106 |
| 2324 | 80 |
| 2325 | 89 |
| 2326 | 133 |
| 2327 | 79 |
| 2328 | 151 |
| 2329 | 75 |
| 2330 | 118 |
| 2331 | 90 |
| 2332 | 63 |
| 2333 | 81 |
| 2334 | 77 |
| 2335 | 118 |
| 2336 | 74 |
| 2337 | 109 |
| 2338 | 82 |
| 2339 | 68 |
| 2340 | 82 |
| 2341 | 81 |
| 2342 | 82 |
| 2343 | 79 |
| 2344 | 92 |
| 2345 | 58 |
| 2346 | 113 |
| 2347 | 140 |
| 2348 | 58 |
| 2349 | 45 |
| 2350 | 94 |
| 2351 | 148 |
| 2352 | 91 |
| 2353 | 72 |
| 2354 | 115 |
| 2355 | 95 |
| 2356 | 78 |
| 2357 | 102 |
| 2358 | 87 |
| 2359 | 126 |
| 2360 | 90 |
| 2361 | 59 |
| 2362 | 100 |
| 2363 | 115 |
| 2364 | 67 |
| 2365 | 72 |
| 2366 | 89 |
| 2367 | 136 |
| 2368 | 127 |
| 2369 | 95 |
| 2370 | 117 |
| 2371 | 85 |
| 2372 | 108 |
| 2373 | 68 |
| 2374 | 60 |
| 2375 | 78 |
| 2376 | 53 |
| 2377 | 69 |
| 2378 | 69 |
| 2379 | 79 |
| 2380 | 53 |
| 2381 | 130 |
| 2382 | 96 |
| 2383 | 117 |
| 2384 | 98 |
| 2385 | 87 |
| 2386 | 97 |
| 2387 | 76 |
| 2388 | 103 |
| 2389 | 78 |
| 2390 | 75 |
| 2391 | 71 |
| 2392 | 63 |
| 2393 | 78 |
| 2394 | 93 |
| 2395 | 57 |
| 2396 | 70 |
| 2397 | 85 |
| 2398 | 120 |
| 2399 | 68 |
| 2400 | 70 |
| 2401 | 92 |
| 2402 | 53 |
| 2403 | 78 |
| 2404 | 91 |
| 2405 | 93 |
| 2406 | 114 |
| 2407 | 84 |
| 2408 | 105 |
| 2409 | 122 |
| 2410 | 123 |
| 2411 | 91 |
| 2412 | 89 |
| 2413 | 108 |
| 2414 | 101 |
| 2415 | 79 |
| 2416 | 83 |
| 2417 | 76 |
| 2418 | 122 |
| 2419 | 82 |
| 2420 | 77 |
| 2421 | 66 |
| 2422 | 79 |
| 2423 | 75 |
| 2424 | 86 |
| 2425 | 37 |
| 2426 | 87 |
| 2427 | 112 |
| 2428 | 67 |
| 2429 | 88 |
| 2430 | 81 |
| 2431 | 88 |
| 2432 | 159 |
| 2433 | 74 |
| 2434 | 84 |
| 2435 | 128 |
| 2436 | 80 |
| 2437 | 120 |
| 2438 | 84 |
| 2439 | 72 |
| 2440 | 104 |
| 2441 | 117 |
| 2442 | 48 |
| 2443 | 80 |
| 2444 | 101 |
| 2445 | 81 |
| 2446 | 65 |
| 2447 | 75 |
| 2448 | 58 |
| 2449 | 76 |
| 2450 | 92 |
| 2451 | 109 |
| 2452 | 65 |
| 2453 | 103 |
| 2454 | 59 |
| 2455 | 78 |
| 2456 | 92 |
| 2457 | 69 |
| 2458 | 46 |
| 2459 | 63 |
| 2460 | 87 |
| 2461 | 85 |
| 2462 | 78 |
| 2463 | 136 |
| 2464 | 124 |
| 2465 | 65 |
| 2466 | 80 |
| 2467 | 90 |
| 2468 | 89 |
| 2469 | 78 |
| 2470 | 93 |
| 2471 | 47 |
| 2472 | 71 |
| 2473 | 94 |
| 2474 | 39 |
| 2475 | 101 |
| 2476 | 94 |
| 2477 | 114 |
| 2478 | 86 |
| 2479 | 211 |
| 2480 | 74 |
| 2481 | 41 |
| 2482 | 93 |
| 2483 | 111 |
| 2484 | 160 |
| 2485 | 83 |
| 2486 | 74 |
| 2487 | 56 |
| 2488 | 101 |
| 2489 | 53 |
| 2490 | 64 |
| 2491 | 67 |
| 2492 | 89 |
| 2493 | 56 |
| 2494 | 56 |
| 2495 | 109 |
| 2496 | 65 |
| 2497 | 113 |
| 2498 | 97 |
| 2499 | 93 |
| 2500 | 34 |
| 2501 | 51 |
| 2502 | 104 |
| 2503 | 76 |
| 2504 | 84 |
| 2505 | 78 |
| 2506 | 99 |
| 2507 | 77 |
| 2508 | 82 |
| 2509 | 75 |
| 2510 | 116 |
| 2511 | 81 |
| 2512 | 113 |
| 2513 | 70 |
| 2514 | 118 |
| 2515 | 82 |
| 2516 | 97 |
| 2517 | 76 |
| 2518 | 75 |
| 2519 | 123 |
| 2520 | 42 |
| 2521 | 76 |
| 2522 | 78 |
| 2523 | 83 |
| 2524 | 94 |
| 2525 | 60 |
| 2526 | 161 |
| 2527 | 78 |
| 2528 | 135 |
| 2529 | 78 |
| 2530 | 70 |
| 2531 | 60 |
| 2532 | 70 |
| 2533 | 94 |
| 2534 | 75 |
| 2535 | 96 |
| 2536 | 75 |
| 2537 | 99 |
| 2538 | 81 |
| 2539 | 139 |
| 2540 | 100 |
| 2541 | 34 |
| 2542 | 173 |
| 2543 | 132 |
| 2544 | 100 |
| 2545 | 168 |
| 2546 | 95 |
| 2547 | 75 |
| 2548 | 77 |
| 2549 | 71 |
| 2550 | 67 |
| 2551 | 81 |
| 2552 | 61 |
| 2553 | 74 |
| 2554 | 58 |
| 2555 | 70 |
| 2556 | 87 |
| 2557 | 66 |
| 2558 | 57 |
| 2559 | 80 |
| 2560 | 103 |
| 2561 | 91 |
| 2562 | 93 |
| 2563 | 98 |
| 2564 | 120 |
| 2565 | 72 |
| 2566 | 78 |
| 2567 | 61 |
| 2568 | 148 |
| 2569 | 95 |
| 2570 | 89 |
| 2571 | 80 |
| 2572 | 64 |
| 2573 | 98 |
| 2574 | 62 |
| 2575 | 97 |
| 2576 | 69 |
| 2577 | 76 |
| 2578 | 78 |
| 2579 | 108 |
| 2580 | 72 |
| 2581 | 130 |
| 2582 | 105 |
| 2583 | 83 |
| 2584 | 67 |
| 2585 | 105 |
| 2586 | 103 |
| 2587 | 79 |
| 2588 | 112 |
| 2589 | 80 |
| 2590 | 74 |
| 2591 | 131 |
| 2592 | 60 |
| 2593 | 95 |
| 2594 | 73 |
| 2595 | 90 |
| 2596 | 91 |
| 2597 | 153 |
| 2598 | 62 |
| 2599 | 55 |
| 2600 | 133 |
| 2601 | 40 |
| 2602 | 56 |
| 2603 | 82 |
| 2604 | 98 |
| 2605 | 67 |
| 2606 | 95 |
| 2607 | 100 |
| 2608 | 144 |
| 2609 | 56 |
| 2610 | 71 |
| 2611 | 67 |
| 2612 | 152 |
| 2613 | 64 |
| 2614 | 103 |
| 2615 | 84 |
| 2616 | 74 |
| 2617 | 68 |
| 2618 | 99 |
| 2619 | 85 |
| 2620 | 84 |
| 2621 | 90 |
| 2622 | 48 |
| 2623 | 87 |
| 2624 | 59 |
| 2625 | 146 |
| 2626 | 159 |
| 2627 | 92 |
| 2628 | 78 |
| 2629 | 76 |
| 2630 | 57 |
| 2631 | 58 |
| 2632 | 80 |
| 2633 | 77 |
| 2634 | 46 |
| 2635 | 44 |
| 2636 | 71 |
| 2637 | 96 |
| 2638 | 109 |
| 2639 | 81 |
| 2640 | 80 |
| 2641 | 83 |
| 2642 | 72 |
| 2643 | 85 |
| 2644 | 98 |
| 2645 | 56 |
| 2646 | 106 |
| 2647 | 82 |
| 2648 | 61 |
| 2649 | 50 |
| 2650 | 81 |
| 2651 | 90 |
| 2652 | 122 |
| 2653 | 133 |
| 2654 | 65 |
| 2655 | 62 |
| 2656 | 36 |
| 2657 | 113 |
| 2658 | 90 |
| 2659 | 134 |
| 2660 | 164 |
| 2661 | 133 |
| 2662 | 60 |
| 2663 | 40 |
| 2664 | 92 |
| 2665 | 87 |
| 2666 | 117 |
| 2667 | 92 |
| 2668 | 86 |
| 2669 | 85 |
| 2670 | 68 |
| 2671 | 75 |
| 2672 | 92 |
| 2673 | 86 |
| 2674 | 97 |
| 2675 | 79 |
| 2676 | 51 |
| 2677 | 74 |
| 2678 | 98 |
| 2679 | 61 |
| 2680 | 78 |
| 2681 | 108 |
| 2682 | 50 |
| 2683 | 70 |
| 2684 | 73 |
| 2685 | 58 |
| 2686 | 78 |
| 2687 | 72 |
| 2688 | 86 |
| 2689 | 121 |
| 2690 | 77 |
| 2691 | 81 |
| 2692 | 99 |
| 2693 | 104 |
| 2694 | 102 |
| 2695 | 78 |
| 2696 | 93 |
| 2697 | 117 |
| 2698 | 91 |
| 2699 | 72 |
| 2700 | 93 |
| 2701 | 73 |
| 2702 | 66 |
| 2703 | 84 |
| 2704 | 54 |
| 2705 | 96 |
| 2706 | 92 |
| 2707 | 82 |
| 2708 | 65 |
| 2709 | 39 |
| 2710 | 49 |
| 2711 | 89 |
| 2712 | 81 |
| 2713 | 110 |
| 2714 | 70 |
| 2715 | 65 |
| 2716 | 76 |
| 2717 | 123 |
| 2718 | 105 |
| 2719 | 73 |
| 2720 | 38 |
| 2721 | 171 |
| 2722 | 96 |
| 2723 | 89 |
| 2724 | 123 |
| 2725 | 96 |
| 2726 | 83 |
| 2727 | 106 |
| 2728 | 84 |
| 2729 | 51 |
| 2730 | 53 |
| 2731 | 83 |
| 2732 | 90 |
| 2733 | 86 |
| 2734 | 61 |
| 2735 | 60 |
| 2736 | 83 |
| 2737 | 79 |
| 2738 | 141 |
| 2739 | 87 |
| 2740 | 125 |
| 2741 | 117 |
| 2742 | 44 |
| 2743 | 71 |
| 2744 | 58 |
| 2745 | 75 |
| 2746 | 86 |
| 2747 | 69 |
| 2748 | 74 |
| 2749 | 73 |
| 2750 | 154 |
| 2751 | 73 |
| 2752 | 77 |
| 2753 | 90 |
| 2754 | 43 |
| 2755 | 95 |
| 2756 | 49 |
| 2757 | 122 |
| 2758 | 109 |
| 2759 | 101 |
| 2760 | 63 |
| 2761 | 80 |
| 2762 | 93 |
| 2763 | 83 |
| 2764 | 54 |
| 2765 | 85 |
| 2766 | 66 |
| 2767 | 61 |
| 2768 | 77 |
| 2769 | 89 |
| 2770 | 78 |
| 2771 | 108 |
| 2772 | 79 |
| 2773 | 90 |
| 2774 | 48 |
| 2775 | 108 |
| 2776 | 87 |
| 2777 | 40 |
| 2778 | 103 |
| 2779 | 78 |
| 2780 | 90 |
| 2781 | 64 |
| 2782 | 79 |
| 2783 | 65 |
| 2784 | 80 |
| 2785 | 137 |
| 2786 | 65 |
| 2787 | 59 |
| 2788 | 103 |
| 2789 | 90 |
| 2790 | 53 |
| 2791 | 106 |
| 2792 | 85 |
| 2793 | 116 |
| 2794 | 75 |
| 2795 | 92 |
| 2796 | 56 |
| 2797 | 94 |
| 2798 | 121 |
| 2799 | 95 |
| 2800 | 186 |
| 2801 | 74 |
| 2802 | 100 |
| 2803 | 79 |
| 2804 | 80 |
| 2805 | 79 |
| 2806 | 60 |
| 2807 | 109 |
| 2808 | 120 |
| 2809 | 99 |
| 2810 | 79 |
| 2811 | 72 |
| 2812 | 27 |
| 2813 | 85 |
| 2814 | 73 |
| 2815 | 89 |
| 2816 | 89 |
| 2817 | 72 |
| 2818 | 64 |
| 2819 | 50 |
| 2820 | 91 |
| 2821 | 79 |
| 2822 | 115 |
| 2823 | 78 |
| 2824 | 81 |
| 2825 | 76 |
| 2826 | 70 |
| 2827 | 111 |
| 2828 | 88 |
| 2829 | 56 |
| 2830 | 74 |
| 2831 | 128 |
| 2832 | 158 |
| 2833 | 79 |
| 2834 | 74 |
| 2835 | 69 |
| 2836 | 80 |
| 2837 | 122 |
| 2838 | 98 |
| 2839 | 70 |
| 2840 | 83 |
| 2841 | 76 |
| 2842 | 113 |
| 2843 | 130 |
| 2844 | 92 |
| 2845 | 78 |
| 2846 | 50 |
| 2847 | 40 |
| 2848 | 76 |
| 2849 | 69 |
| 2850 | 156 |
| 2851 | 108 |
| 2852 | 114 |
| 2853 | 84 |
| 2854 | 103 |
| 2855 | 74 |
| 2856 | 49 |
| 2857 | 113 |
| 2858 | 94 |
| 2859 | 82 |
| 2860 | 63 |
| 2861 | 73 |
| 2862 | 84 |
| 2863 | 68 |
| 2864 | 71 |
| 2865 | 98 |
| 2866 | 100 |
| 2867 | 77 |
| 2868 | 103 |
| 2869 | 86 |
| 2870 | 58 |
| 2871 | 63 |
| 2872 | 61 |
| 2873 | 67 |
| 2874 | 84 |
| 2875 | 101 |
| 2876 | 124 |
| 2877 | 68 |
| 2878 | 60 |
| 2879 | 80 |
| 2880 | 84 |
| 2881 | 100 |
| 2882 | 77 |
| 2883 | 73 |
| 2884 | 76 |
| 2885 | 78 |
| 2886 | 69 |
| 2887 | 100 |
| 2888 | 90 |
| 2889 | 95 |
| 2890 | 91 |
| 2891 | 94 |
| 2892 | 54 |
| 2893 | 87 |
| 2894 | 75 |
| 2895 | 115 |
| 2896 | 65 |
| 2897 | 65 |
| 2898 | 86 |
| 2899 | 119 |
| 2900 | 58 |
| 2901 | 113 |
| 2902 | 57 |
| 2903 | 116 |
| 2904 | 52 |
| 2905 | 107 |
| 2906 | 56 |
| 2907 | 111 |
| 2908 | 42 |
| 2909 | 82 |
| 2910 | 88 |
| 2911 | 75 |
| 2912 | 83 |
| 2913 | 113 |
| 2914 | 138 |
| 2915 | 71 |
| 2916 | 74 |
| 2917 | 77 |
| 2918 | 125 |
| 2919 | 108 |
| 2920 | 67 |
| 2921 | 78 |
| 2922 | 78 |
| 2923 | 116 |
| 2924 | 95 |
| 2925 | 62 |
| 2926 | 96 |
| 2927 | 91 |
| 2928 | 60 |
| 2929 | 82 |
| 2930 | 58 |
| 2931 | 83 |
| 2932 | 121 |
| 2933 | 60 |
| 2934 | 208 |
| 2935 | 67 |
| 2936 | 88 |
| 2937 | 60 |
| 2938 | 77 |
| 2939 | 87 |
| 2940 | 127 |
| 2941 | 54 |
| 2942 | 90 |
| 2943 | 97 |
| 2944 | 50 |
| 2945 | 66 |
| 2946 | 66 |
| 2947 | 78 |
| 2948 | 109 |
| 2949 | 82 |
| 2950 | 97 |
| 2951 | 97 |
| 2952 | 173 |
| 2953 | 159 |
| 2954 | 95 |
| 2955 | 67 |
| 2956 | 43 |
| 2957 | 56 |
| 2958 | 88 |
| 2959 | 98 |
| 2960 | 92 |
| 2961 | 109 |
| 2962 | 87 |
| 2963 | 149 |
| 2964 | 166 |
| 2965 | 56 |
| 2966 | 83 |
| 2967 | 79 |
| 2968 | 76 |
| 2969 | 85 |
| 2970 | 70 |
| 2971 | 148 |
| 2972 | 72 |
| 2973 | 94 |
| 2974 | 78 |
| 2975 | 90 |
| 2976 | 101 |
| 2977 | 79 |
| 2978 | 91 |
| 2979 | 77 |
| 2980 | 52 |
| 2981 | 53 |
| 2982 | 70 |
| 2983 | 89 |
| 2984 | 68 |
| 2985 | 85 |
| 2986 | 56 |
| 2987 | 123 |
| 2988 | 82 |
| 2989 | 103 |
| 2990 | 119 |
| 2991 | 111 |
| 2992 | 54 |
| 2993 | 74 |
| 2994 | 79 |
| 2995 | 102 |
| 2996 | 76 |
| 2997 | 102 |
| 2998 | 71 |
| 2999 | 73 |
| 3000 | 79 |
| 3001 | 120 |
| 3002 | 80 |
| 3003 | 82 |
| 3004 | 68 |
| 3005 | 76 |
| 3006 | 113 |
| 3007 | 100 |
| 3008 | 106 |
| 3009 | 81 |
| 3010 | 57 |
| 3011 | 74 |
| 3012 | 33 |
| 3013 | 99 |
| 3014 | 139 |
| 3015 | 108 |
| 3016 | 148 |
| 3017 | 78 |
| 3018 | 105 |
| 3019 | 113 |
| 3020 | 96 |
| 3021 | 79 |
| 3022 | 82 |
| 3023 | 105 |
| 3024 | 56 |
| 3025 | 74 |
| 3026 | 95 |
| 3027 | 65 |
| 3028 | 88 |
| 3029 | 114 |
| 3030 | 105 |
| 3031 | 93 |
| 3032 | 68 |
| 3033 | 150 |
| 3034 | 103 |
| 3035 | 81 |
| 3036 | 81 |
| 3037 | 66 |
| 3038 | 100 |
| 3039 | 47 |
| 3040 | 86 |
| 3041 | 89 |
| 3042 | 74 |
| 3043 | 81 |
| 3044 | 118 |
| 3045 | 75 |
| 3046 | 104 |
| 3047 | 110 |
| 3048 | 88 |
| 3049 | 53 |
| 3050 | 99 |
| 3051 | 78 |
| 3052 | 54 |
| 3053 | 76 |
| 3054 | 95 |
| 3055 | 66 |
| 3056 | 51 |
| 3057 | 98 |
| 3058 | 105 |
| 3059 | 107 |
| 3060 | 135 |
| 3061 | 53 |
| 3062 | 89 |
| 3063 | 99 |
| 3064 | 91 |
| 3065 | 92 |
| 3066 | 73 |
| 3067 | 91 |
| 3068 | 90 |
| 3069 | 85 |
| 3070 | 100 |
| 3071 | 68 |
| 3072 | 62 |
| 3073 | 88 |
| 3074 | 90 |
| 3075 | 60 |
| 3076 | 72 |
| 3077 | 103 |
| 3078 | 122 |
| 3079 | 136 |
| 3080 | 81 |
| 3081 | 132 |
| 3082 | 80 |
| 3083 | 74 |
| 3084 | 86 |
| 3085 | 95 |
| 3086 | 94 |
| 3087 | 82 |
| 3088 | 63 |
| 3089 | 68 |
| 3090 | 80 |
| 3091 | 75 |
| 3092 | 101 |
| 3093 | 117 |
| 3094 | 44 |
| 3095 | 83 |
| 3096 | 112 |
| 3097 | 56 |
| 3098 | 106 |
| 3099 | 147 |
| 3100 | 78 |
| 3101 | 87 |
| 3102 | 44 |
| 3103 | 84 |
| 3104 | 105 |
| 3105 | 59 |
| 3106 | 116 |
| 3107 | 68 |
| 3108 | 99 |
| 3109 | 51 |
| 3110 | 91 |
| 3111 | 71 |
| 3112 | 84 |
| 3113 | 60 |
| 3114 | 113 |
| 3115 | 63 |
| 3116 | 124 |
| 3117 | 78 |
| 3118 | 72 |
| 3119 | 80 |
| 3120 | 83 |
| 3121 | 66 |
| 3122 | 92 |
| 3123 | 60 |
| 3124 | 277 |
| 3125 | 75 |
| 3126 | 81 |
| 3127 | 60 |
| 3128 | 66 |
| 3129 | 75 |
| 3130 | 75 |
| 3131 | 98 |
| 3132 | 92 |
| 3133 | 78 |
| 3134 | 78 |
| 3135 | 67 |
| 3136 | 59 |
| 3137 | 82 |
| 3138 | 68 |
| 3139 | 116 |
| 3140 | 120 |
| 3141 | 80 |
| 3142 | 113 |
| 3143 | 99 |
| 3144 | 74 |
| 3145 | 79 |
| 3146 | 60 |
| 3147 | 106 |
| 3148 | 34 |
| 3149 | 70 |
| 3150 | 77 |
| 3151 | 47 |
| 3152 | 49 |
| 3153 | 84 |
| 3154 | 62 |
| 3155 | 79 |
| 3156 | 101 |
| 3157 | 56 |
| 3158 | 61 |
| 3159 | 69 |
| 3160 | 75 |
| 3161 | 96 |
| 3162 | 76 |
| 3163 | 62 |
| 3164 | 92 |
| 3165 | 73 |
| 3166 | 113 |
| 3167 | 90 |
| 3168 | 132 |
| 3169 | 80 |
| 3170 | 82 |
| 3171 | 127 |
| 3172 | 71 |
| 3173 | 143 |
| 3174 | 75 |
| 3175 | 78 |
| 3176 | 61 |
| 3177 | 116 |
| 3178 | 48 |
| 3179 | 78 |
| 3180 | 57 |
| 3181 | 81 |
| 3182 | 103 |
| 3183 | 65 |
| 3184 | 82 |
| 3185 | 62 |
| 3186 | 78 |
| 3187 | 66 |
| 3188 | 111 |
| 3189 | 90 |
| 3190 | 117 |
| 3191 | 54 |
| 3192 | 83 |
| 3193 | 68 |
| 3194 | 101 |
| 3195 | 83 |
| 3196 | 125 |
| 3197 | 80 |
| 3198 | 77 |
| 3199 | 118 |
| 3200 | 46 |
| 3201 | 128 |
| 3202 | 44 |
| 3203 | 68 |
| 3204 | 89 |
| 3205 | 93 |
| 3206 | 74 |
| 3207 | 97 |
| 3208 | 77 |
| 3209 | 119 |
| 3210 | 52 |
| 3211 | 74 |
| 3212 | 90 |
| 3213 | 79 |
| 3214 | 108 |
| 3215 | 78 |
| 3216 | 102 |
| 3217 | 72 |
| 3218 | 108 |
| 3219 | 112 |
| 3220 | 107 |
| 3221 | 49 |
| 3222 | 57 |
| 3223 | 189 |
| 3224 | 57 |
| 3225 | 61 |
| 3226 | 97 |
| 3227 | 61 |
| 3228 | 84 |
| 3229 | 156 |
| 3230 | 87 |
| 3231 | 65 |
| 3232 | 91 |
| 3233 | 39 |
| 3234 | 85 |
| 3235 | 80 |
| 3236 | 97 |
| 3237 | 84 |
| 3238 | 102 |
| 3239 | 80 |
| 3240 | 190 |
| 3241 | 85 |
| 3242 | 55 |
| 3243 | 58 |
| 3244 | 108 |
| 3245 | 85 |
| 3246 | 81 |
| 3247 | 93 |
| 3248 | 95 |
| 3249 | 77 |
| 3250 | 56 |
| 3251 | 36 |
| 3252 | 68 |
| 3253 | 80 |
| 3254 | 85 |
| 3255 | 80 |
| 3256 | 86 |
| 3257 | 139 |
| 3258 | 83 |
| 3259 | 48 |
| 3260 | 87 |
| 3261 | 98 |
| 3262 | 49 |
| 3263 | 73 |
| 3264 | 54 |
| 3265 | 66 |
| 3266 | 98 |
| 3267 | 54 |
| 3268 | 109 |
| 3269 | 133 |
| 3270 | 69 |
| 3271 | 79 |
| 3272 | 69 |
| 3273 | 91 |
| 3274 | 87 |
| 3275 | 52 |
| 3276 | 126 |
| 3277 | 89 |
| 3278 | 83 |
| 3279 | 58 |
| 3280 | 121 |
| 3281 | 88 |
| 3282 | 101 |
| 3283 | 85 |
| 3284 | 93 |
| 3285 | 91 |
| 3286 | 72 |
| 3287 | 83 |
| 3288 | 85 |
| 3289 | 49 |
| 3290 | 61 |
| 3291 | 110 |
| 3292 | 158 |
| 3293 | 69 |
| 3294 | 53 |
| 3295 | 115 |
| 3296 | 95 |
| 3297 | 75 |
| 3298 | 90 |
| 3299 | 83 |
| 3300 | 130 |
| 3301 | 98 |
| 3302 | 65 |
| 3303 | 107 |
| 3304 | 97 |
| 3305 | 123 |
| 3306 | 47 |
| 3307 | 84 |
| 3308 | 84 |
| 3309 | 53 |
| 3310 | 117 |
| 3311 | 54 |
| 3312 | 63 |
| 3313 | 73 |
| 3314 | 60 |
| 3315 | 61 |
| 3316 | 72 |
| 3317 | 79 |
| 3318 | 86 |
| 3319 | 93 |
| 3320 | 56 |
| 3321 | 47 |
| 3322 | 95 |
| 3323 | 92 |
| 3324 | 131 |
| 3325 | 82 |
| 3326 | 85 |
| 3327 | 85 |
| 3328 | 104 |
| 3329 | 91 |
| 3330 | 89 |
| 3331 | 110 |
| 3332 | 60 |
| 3333 | 112 |
| 3334 | 78 |
| 3335 | 92 |
| 3336 | 113 |
| 3337 | 60 |
| 3338 | 90 |
| 3339 | 87 |
| 3340 | 74 |
| 3341 | 89 |
| 3342 | 57 |
| 3343 | 69 |
| 3344 | 60 |
| 3345 | 78 |
| 3346 | 75 |
| 3347 | 47 |
| 3348 | 98 |
| 3349 | 80 |
| 3350 | 88 |
| 3351 | 65 |
| 3352 | 89 |
| 3353 | 75 |
| 3354 | 85 |
| 3355 | 86 |
| 3356 | 114 |
| 3357 | 72 |
| 3358 | 119 |
| 3359 | 65 |
| 3360 | 59 |
| 3361 | 70 |
| 3362 | 77 |
| 3363 | 49 |
| 3364 | 91 |
| 3365 | 80 |
| 3366 | 89 |
| 3367 | 100 |
| 3368 | 62 |
| 3369 | 91 |
| 3370 | 119 |
| 3371 | 86 |
| 3372 | 112 |
| 3373 | 110 |
| 3374 | 99 |
| 3375 | 68 |
| 3376 | 109 |
| 3377 | 74 |
| 3378 | 66 |
| 3379 | 82 |
| 3380 | 103 |
| 3381 | 50 |
| 3382 | 132 |
| 3383 | 89 |
| 3384 | 74 |
| 3385 | 94 |
| 3386 | 104 |
| 3387 | 70 |
| 3388 | 72 |
| 3389 | 59 |
| 3390 | 71 |
| 3391 | 78 |
| 3392 | 79 |
| 3393 | 90 |
| 3394 | 74 |
| 3395 | 79 |
| 3396 | 101 |
| 3397 | 71 |
| 3398 | 71 |
| 3399 | 151 |
| 3400 | 99 |
| 3401 | 40 |
| 3402 | 85 |
| 3403 | 103 |
| 3404 | 79 |
| 3405 | 67 |
| 3406 | 113 |
| 3407 | 107 |
| 3408 | 77 |
| 3409 | 88 |
| 3410 | 73 |
| 3411 | 87 |
| 3412 | 73 |
| 3413 | 78 |
| 3414 | 56 |
| 3415 | 101 |
| 3416 | 93 |
| 3417 | 110 |
| 3418 | 107 |
| 3419 | 104 |
| 3420 | 111 |
| 3421 | 107 |
| 3422 | 133 |
| 3423 | 89 |
| 3424 | 95 |
| 3425 | 77 |
| 3426 | 78 |
| 3427 | 102 |
| 3428 | 78 |
| 3429 | 104 |
| 3430 | 77 |
| 3431 | 121 |
| 3432 | 109 |
| 3433 | 99 |
| 3434 | 71 |
| 3435 | 96 |
| 3436 | 61 |
| 3437 | 35 |
| 3438 | 45 |
| 3439 | 75 |
| 3440 | 50 |
| 3441 | 124 |
| 3442 | 63 |
| 3443 | 103 |
| 3444 | 103 |
| 3445 | 63 |
| 3446 | 85 |
| 3447 | 100 |
| 3448 | 85 |
| 3449 | 104 |
| 3450 | 59 |
| 3451 | 102 |
| 3452 | 86 |
| 3453 | 157 |
| 3454 | 82 |
| 3455 | 100 |
| 3456 | 97 |
| 3457 | 78 |
| 3458 | 107 |
| 3459 | 74 |
| 3460 | 86 |
| 3461 | 135 |
| 3462 | 79 |
| 3463 | 59 |
| 3464 | 56 |
| 3465 | 57 |
| 3466 | 54 |
| 3467 | 65 |
| 3468 | 143 |
| 3469 | 78 |
| 3470 | 94 |
| 3471 | 77 |
| 3472 | 69 |
| 3473 | 77 |
| 3474 | 92 |
| 3475 | 86 |
| 3476 | 57 |
| 3477 | 112 |
| 3478 | 111 |
| 3479 | 59 |
| 3480 | 96 |
| 3481 | 79 |
| 3482 | 111 |
| 3483 | 66 |
| 3484 | 76 |
| 3485 | 61 |
| 3486 | 117 |
| 3487 | 53 |
| 3488 | 83 |
| 3489 | 109 |
| 3490 | 92 |
| 3491 | 81 |
| 3492 | 69 |
| 3493 | 87 |
| 3494 | 109 |
| 3495 | 71 |
| 3496 | 73 |
| 3497 | 87 |
| 3498 | 71 |
| 3499 | 85 |
| 3500 | 92 |
| 3501 | 67 |
| 3502 | 91 |
| 3503 | 82 |
| 3504 | 87 |
| 3505 | 78 |
| 3506 | 73 |
| 3507 | 78 |
| 3508 | 82 |
| 3509 | 143 |
| 3510 | 139 |
| 3511 | 56 |
| 3512 | 91 |
| 3513 | 89 |
| 3514 | 127 |
| 3515 | 142 |
| 3516 | 74 |
| 3517 | 55 |
| 3518 | 64 |
| 3519 | 65 |
| 3520 | 74 |
| 3521 | 71 |
| 3522 | 141 |
| 3523 | 117 |
| 3524 | 74 |
| 3525 | 125 |
| 3526 | 62 |
| 3527 | 51 |
| 3528 | 99 |
| 3529 | 134 |
| 3530 | 61 |
| 3531 | 106 |
| 3532 | 157 |
| 3533 | 72 |
| 3534 | 59 |
| 3535 | 93 |
| 3536 | 82 |
| 3537 | 120 |
| 3538 | 137 |
| 3539 | 73 |
| 3540 | 97 |
| 3541 | 65 |
| 3542 | 89 |
| 3543 | 105 |
| 3544 | 104 |
| 3545 | 77 |
| 3546 | 78 |
| 3547 | 123 |
| 3548 | 137 |
| 3549 | 51 |
| 3550 | 115 |
| 3551 | 106 |
| 3552 | 46 |
| 3553 | 106 |
| 3554 | 126 |
| 3555 | 59 |
| 3556 | 63 |
| 3557 | 69 |
| 3558 | 108 |
| 3559 | 89 |
| 3560 | 90 |
| 3561 | 103 |
| 3562 | 54 |
| 3563 | 78 |
| 3564 | 92 |
| 3565 | 87 |
| 3566 | 64 |
| 3567 | 92 |
| 3568 | 61 |
| 3569 | 112 |
| 3570 | 76 |
| 3571 | 93 |
| 3572 | 100 |
| 3573 | 89 |
| 3574 | 78 |
| 3575 | 104 |
| 3576 | 75 |
| 3577 | 45 |
| 3578 | 79 |
| 3579 | 76 |
| 3580 | 87 |
| 3581 | 57 |
| 3582 | 137 |
| 3583 | 68 |
| 3584 | 97 |
| 3585 | 80 |
| 3586 | 57 |
| 3587 | 56 |
| 3588 | 68 |
| 3589 | 94 |
| 3590 | 98 |
| 3591 | 71 |
| 3592 | 86 |
| 3593 | 95 |
| 3594 | 97 |
| 3595 | 87 |
| 3596 | 86 |
| 3597 | 54 |
| 3598 | 76 |
| 3599 | 59 |
| 3600 | 74 |
| 3601 | 81 |
| 3602 | 88 |
| 3603 | 66 |
| 3604 | 87 |
| 3605 | 78 |
| 3606 | 88 |
| 3607 | 56 |
| 3608 | 97 |
| 3609 | 85 |
| 3610 | 101 |
| 3611 | 99 |
| 3612 | 77 |
| 3613 | 75 |
| 3614 | 72 |
| 3615 | 105 |
| 3616 | 79 |
| 3617 | 64 |
| 3618 | 80 |
| 3619 | 66 |
| 3620 | 77 |
| 3621 | 112 |
| 3622 | 108 |
| 3623 | 88 |
| 3624 | 88 |
| 3625 | 87 |
| 3626 | 98 |
| 3627 | 62 |
| 3628 | 82 |
| 3629 | 55 |
| 3630 | 114 |
| 3631 | 40 |
| 3632 | 111 |
| 3633 | 82 |
| 3634 | 70 |
| 3635 | 62 |
| 3636 | 73 |
| 3637 | 67 |
| 3638 | 68 |
| 3639 | 94 |
| 3640 | 113 |
| 3641 | 53 |
| 3642 | 73 |
| 3643 | 113 |
| 3644 | 175 |
| 3645 | 73 |
| 3646 | 102 |
| 3647 | 109 |
| 3648 | 100 |
| 3649 | 82 |
| 3650 | 101 |
| 3651 | 109 |
| 3652 | 78 |
| 3653 | 103 |
| 3654 | 77 |
| 3655 | 90 |
| 3656 | 103 |
| 3657 | 74 |
| 3658 | 74 |
| 3659 | 74 |
| 3660 | 56 |
| 3661 | 108 |
| 3662 | 109 |
| 3663 | 123 |
| 3664 | 89 |
| 3665 | 62 |
| 3666 | 82 |
| 3667 | 83 |
| 3668 | 84 |
| 3669 | 116 |
| 3670 | 84 |
| 3671 | 87 |
| 3672 | 79 |
| 3673 | 65 |
| 3674 | 123 |
| 3675 | 74 |
| 3676 | 96 |
| 3677 | 68 |
| 3678 | 89 |
| 3679 | 102 |
| 3680 | 131 |
| 3681 | 125 |
| 3682 | 65 |
| 3683 | 75 |
| 3684 | 90 |
| 3685 | 82 |
| 3686 | 78 |
| 3687 | 87 |
| 3688 | 125 |
| 3689 | 120 |
| 3690 | 72 |
| 3691 | 26 |
| 3692 | 132 |
| 3693 | 96 |
| 3694 | 73 |
| 3695 | 66 |
| 3696 | 77 |
| 3697 | 52 |
| 3698 | 58 |
| 3699 | 57 |
| 3700 | 75 |
| 3701 | 92 |
| 3702 | 65 |
| 3703 | 46 |
| 3704 | 161 |
| 3705 | 100 |
| 3706 | 89 |
| 3707 | 93 |
| 3708 | 117 |
| 3709 | 72 |
| 3710 | 97 |
| 3711 | 133 |
| 3712 | 96 |
| 3713 | 170 |
| 3714 | 81 |
| 3715 | 30 |
| 3716 | 53 |
| 3717 | 108 |
| 3718 | 88 |
| 3719 | 69 |
| 3720 | 105 |
| 3721 | 85 |
| 3722 | 67 |
| 3723 | 82 |
| 3724 | 54 |
| 3725 | 98 |
| 3726 | 94 |
| 3727 | 63 |
| 3728 | 80 |
| 3729 | 62 |
| 3730 | 133 |
| 3731 | 74 |
| 3732 | 68 |
| 3733 | 78 |
| 3734 | 90 |
| 3735 | 106 |
| 3736 | 75 |
| 3737 | 89 |
| 3738 | 82 |
| 3739 | 103 |
| 3740 | 87 |
| 3741 | 77 |
| 3742 | 93 |
| 3743 | 67 |
| 3744 | 69 |
| 3745 | 54 |
| 3746 | 70 |
| 3747 | 84 |
| 3748 | 96 |
| 3749 | 77 |
| 3750 | 110 |
| 3751 | 99 |
| 3752 | 141 |
| 3753 | 63 |
| 3754 | 85 |
| 3755 | 79 |
| 3756 | 82 |
| 3757 | 77 |
| 3758 | 95 |
| 3759 | 68 |
| 3760 | 96 |
| 3761 | 77 |
| 3762 | 53 |
| 3763 | 76 |
| 3764 | 115 |
| 3765 | 72 |
| 3766 | 55 |
| 3767 | 89 |
| 3768 | 45 |
| 3769 | 56 |
| 3770 | 138 |
| 3771 | 68 |
| 3772 | 89 |
| 3773 | 68 |
| 3774 | 102 |
| 3775 | 85 |
| 3776 | 53 |
| 3777 | 108 |
| 3778 | 53 |
| 3779 | 96 |
| 3780 | 56 |
| 3781 | 80 |
| 3782 | 69 |
| 3783 | 80 |
| 3784 | 75 |
| 3785 | 85 |
| 3786 | 60 |
| 3787 | 82 |
| 3788 | 59 |
| 3789 | 44 |
| 3790 | 99 |
| 3791 | 64 |
| 3792 | 70 |
| 3793 | 84 |
| 3794 | 109 |
| 3795 | 95 |
| 3796 | 92 |
| 3797 | 112 |
| 3798 | 61 |
| 3799 | 67 |
| 3800 | 48 |
| 3801 | 85 |
| 3802 | 97 |
| 3803 | 40 |
| 3804 | 55 |
| 3805 | 100 |
| 3806 | 88 |
| 3807 | 72 |
| 3808 | 84 |
| 3809 | 98 |
| 3810 | 72 |
| 3811 | 125 |
| 3812 | 64 |
| 3813 | 107 |
| 3814 | 115 |
| 3815 | 38 |
| 3816 | 84 |
| 3817 | 113 |
| 3818 | 87 |
| 3819 | 33 |
| 3820 | 63 |
| 3821 | 103 |
| 3822 | 112 |
| 3823 | 66 |
| 3824 | 78 |
| 3825 | 97 |
| 3826 | 94 |
| 3827 | 61 |
| 3828 | 70 |
| 3829 | 72 |
| 3830 | 78 |
| 3831 | 86 |
| 3832 | 64 |
| 3833 | 59 |
| 3834 | 69 |
| 3835 | 171 |
| 3836 | 88 |
| 3837 | 74 |
| 3838 | 43 |
| 3839 | 116 |
| 3840 | 68 |
| 3841 | 85 |
| 3842 | 58 |
| 3843 | 88 |
| 3844 | 71 |
| 3845 | 63 |
| 3846 | 115 |
| 3847 | 106 |
| 3848 | 74 |
| 3849 | 58 |
| 3850 | 102 |
| 3851 | 79 |
| 3852 | 75 |
| 3853 | 70 |
| 3854 | 143 |
| 3855 | 74 |
| 3856 | 87 |
| 3857 | 118 |
| 3858 | 50 |
| 3859 | 64 |
| 3860 | 88 |
| 3861 | 70 |
| 3862 | 85 |
| 3863 | 87 |
| 3864 | 77 |
| 3865 | 76 |
| 3866 | 100 |
| 3867 | 92 |
| 3868 | 131 |
| 3869 | 52 |
| 3870 | 73 |
| 3871 | 73 |
| 3872 | 43 |
| 3873 | 83 |
| 3874 | 78 |
| 3875 | 71 |
| 3876 | 82 |
| 3877 | 81 |
| 3878 | 107 |
| 3879 | 124 |
| 3880 | 139 |
| 3881 | 96 |
| 3882 | 78 |
| 3883 | 136 |
| 3884 | 86 |
| 3885 | 101 |
| 3886 | 79 |
| 3887 | 63 |
| 3888 | 76 |
| 3889 | 53 |
| 3890 | 41 |
| 3891 | 51 |
| 3892 | 144 |
| 3893 | 139 |
| 3894 | 77 |
| 3895 | 49 |
| 3896 | 133 |
| 3897 | 82 |
| 3898 | 100 |
| 3899 | 119 |
| 3900 | 117 |
| 3901 | 106 |
| 3902 | 143 |
| 3903 | 78 |
| 3904 | 84 |
| 3905 | 93 |
| 3906 | 85 |
| 3907 | 102 |
| 3908 | 106 |
| 3909 | 84 |
| 3910 | 87 |
| 3911 | 68 |
| 3912 | 72 |
| 3913 | 101 |
| 3914 | 77 |
| 3915 | 85 |
| 3916 | 119 |
| 3917 | 185 |
| 3918 | 88 |
| 3919 | 61 |
| 3920 | 70 |
| 3921 | 89 |
| 3922 | 85 |
| 3923 | 92 |
| 3924 | 44 |
| 3925 | 120 |
| 3926 | 135 |
| 3927 | 71 |
| 3928 | 76 |
| 3929 | 61 |
| 3930 | 102 |
| 3931 | 126 |
| 3932 | 77 |
| 3933 | 83 |
| 3934 | 90 |
| 3935 | 63 |
| 3936 | 78 |
| 3937 | 116 |
| 3938 | 121 |
| 3939 | 77 |
| 3940 | 83 |
| 3941 | 78 |
| 3942 | 88 |
| 3943 | 74 |
| 3944 | 73 |
| 3945 | 78 |
| 3946 | 57 |
| 3947 | 82 |
| 3948 | 70 |
| 3949 | 126 |
| 3950 | 99 |
| 3951 | 78 |
| 3952 | 93 |
| 3953 | 114 |
| 3954 | 78 |
| 3955 | 88 |
| 3956 | 75 |
| 3957 | 41 |
| 3958 | 112 |
| 3959 | 101 |
| 3960 | 110 |
| 3961 | 63 |
| 3962 | 113 |
| 3963 | 72 |
| 3964 | 84 |
| 3965 | 92 |
| 3966 | 130 |
| 3967 | 68 |
| 3968 | 89 |
| 3969 | 103 |
| 3970 | 77 |
| 3971 | 85 |
| 3972 | 99 |
| 3973 | 70 |
| 3974 | 100 |
| 3975 | 130 |
| 3976 | 77 |
| 3977 | 96 |
| 3978 | 110 |
| 3979 | 133 |
| 3980 | 76 |
| 3981 | 72 |
| 3982 | 99 |
| 3983 | 97 |
| 3984 | 81 |
| 3985 | 74 |
| 3986 | 91 |
| 3987 | 76 |
| 3988 | 77 |
| 3989 | 71 |
| 3990 | 113 |
| 3991 | 75 |
| 3992 | 95 |
| 3993 | 117 |
| 3994 | 106 |
| 3995 | 120 |
| 3996 | 48 |
| 3997 | 93 |
| 3998 | 123 |
| 3999 | 119 |
| 4000 | 83 |
| 4001 | 207 |
| 4002 | 96 |
| 4003 | 85 |
| 4004 | 70 |
| 4005 | 137 |
| 4006 | 101 |
| 4007 | 76 |
| 4008 | 74 |
| 4009 | 105 |
| 4010 | 54 |
| 4011 | 69 |
| 4012 | 78 |
| 4013 | 101 |
| 4014 | 65 |
| 4015 | 76 |
| 4016 | 125 |
| 4017 | 82 |
| 4018 | 50 |
| 4019 | 89 |
| 4020 | 105 |
| 4021 | 131 |
| 4022 | 116 |
| 4023 | 97 |
| 4024 | 77 |
| 4025 | 82 |
| 4026 | 83 |
| 4027 | 78 |
| 4028 | 101 |
| 4029 | 81 |
| 4030 | 133 |
| 4031 | 75 |
| 4032 | 80 |
| 4033 | 76 |
| 4034 | 59 |
| 4035 | 62 |
| 4036 | 107 |
| 4037 | 66 |
| 4038 | 96 |
| 4039 | 85 |
| 4040 | 54 |
| 4041 | 53 |
| 4042 | 87 |
| 4043 | 99 |
| 4044 | 78 |
| 4045 | 137 |
| 4046 | 125 |
| 4047 | 62 |
| 4048 | 109 |
| 4049 | 66 |
| 4050 | 78 |
| 4051 | 87 |
| 4052 | 77 |
| 4053 | 134 |
| 4054 | 77 |
| 4055 | 110 |
| 4056 | 72 |
| 4057 | 126 |
| 4058 | 120 |
| 4059 | 54 |
| 4060 | 135 |
| 4061 | 106 |
| 4062 | 52 |
| 4063 | 117 |
| 4064 | 123 |
| 4065 | 96 |
| 4066 | 64 |
| 4067 | 78 |
| 4068 | 114 |
| 4069 | 98 |
| 4070 | 62 |
| 4071 | 149 |
| 4072 | 43 |
| 4073 | 68 |
| 4074 | 121 |
| 4075 | 53 |
| 4076 | 77 |
| 4077 | 93 |
| 4078 | 81 |
| 4079 | 49 |
| 4080 | 78 |
| 4081 | 98 |
| 4082 | 86 |
| 4083 | 84 |
| 4084 | 96 |
| 4085 | 79 |
| 4086 | 61 |
| 4087 | 63 |
| 4088 | 78 |
| 4089 | 99 |
| 4090 | 95 |
| 4091 | 79 |
| 4092 | 60 |
| 4093 | 80 |
| 4094 | 82 |
| 4095 | 79 |
| 4096 | 76 |
| 4097 | 97 |
| 4098 | 74 |
| 4099 | 79 |
| 4100 | 91 |
| 4101 | 96 |
| 4102 | 77 |
| 4103 | 142 |
| 4104 | 65 |
| 4105 | 80 |
| 4106 | 76 |
| 4107 | 64 |
| 4108 | 93 |
| 4109 | 71 |
| 4110 | 67 |
| 4111 | 51 |
| 4112 | 74 |
| 4113 | 111 |
| 4114 | 62 |
| 4115 | 67 |
| 4116 | 98 |
| 4117 | 93 |
| 4118 | 108 |
| 4119 | 90 |
| 4120 | 72 |
| 4121 | 122 |
| 4122 | 76 |
| 4123 | 87 |
| 4124 | 41 |
| 4125 | 70 |
| 4126 | 90 |
| 4127 | 65 |
| 4128 | 101 |
| 4129 | 120 |
| 4130 | 82 |
| 4131 | 122 |
| 4132 | 156 |
| 4133 | 74 |
| 4134 | 74 |
| 4135 | 112 |
| 4136 | 120 |
| 4137 | 105 |
| 4138 | 134 |
| 4139 | 57 |
| 4140 | 132 |
| 4141 | 77 |
| 4142 | 82 |
| 4143 | 74 |
| 4144 | 95 |
| 4145 | 73 |
| 4146 | 92 |
| 4147 | 96 |
| 4148 | 73 |
| 4149 | 100 |
| 4150 | 85 |
| 4151 | 68 |
| 4152 | 59 |
| 4153 | 66 |
| 4154 | 114 |
| 4155 | 48 |
| 4156 | 66 |
| 4157 | 92 |
| 4158 | 58 |
| 4159 | 55 |
| 4160 | 47 |
| 4161 | 72 |
| 4162 | 67 |
| 4163 | 90 |
| 4164 | 80 |
| 4165 | 75 |
| 4166 | 48 |
| 4167 | 75 |
| 4168 | 77 |
| 4169 | 82 |
| 4170 | 97 |
| 4171 | 86 |
| 4172 | 159 |
| 4173 | 60 |
| 4174 | 49 |
| 4175 | 83 |
| 4176 | 30 |
| 4177 | 157 |
| 4178 | 102 |
| 4179 | 90 |
| 4180 | 97 |
| 4181 | 90 |
| 4182 | 154 |
| 4183 | 59 |
| 4184 | 102 |
| 4185 | 88 |
| 4186 | 71 |
| 4187 | 152 |
| 4188 | 59 |
| 4189 | 101 |
| 4190 | 89 |
| 4191 | 57 |
| 4192 | 154 |
| 4193 | 92 |